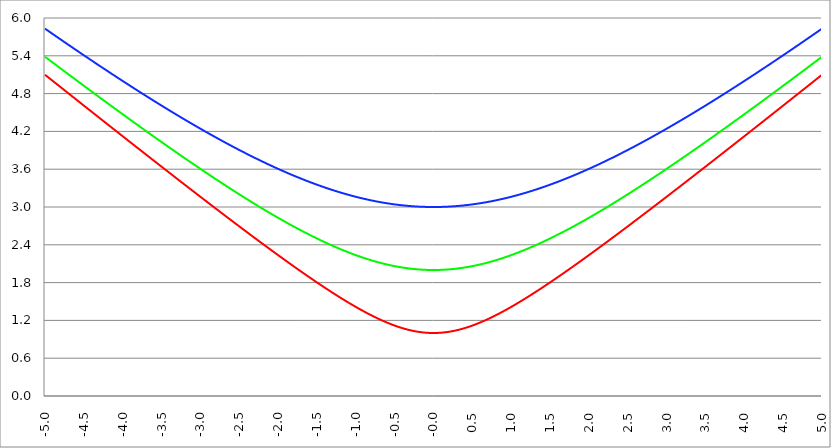
| Category | Series 1 | Series 0 | Series 2 |
|---|---|---|---|
| -5.0 | 5.099 | 5.385 | 5.831 |
| -4.995 | 5.094 | 5.381 | 5.827 |
| -4.99 | 5.089 | 5.376 | 5.822 |
| -4.985 | 5.084 | 5.371 | 5.818 |
| -4.98 | 5.079 | 5.367 | 5.814 |
| -4.975 | 5.075 | 5.362 | 5.81 |
| -4.97 | 5.07 | 5.357 | 5.805 |
| -4.965000000000001 | 5.065 | 5.353 | 5.801 |
| -4.960000000000001 | 5.06 | 5.348 | 5.797 |
| -4.955000000000001 | 5.055 | 5.343 | 5.792 |
| -4.950000000000001 | 5.05 | 5.339 | 5.788 |
| -4.945000000000001 | 5.045 | 5.334 | 5.784 |
| -4.940000000000001 | 5.04 | 5.33 | 5.78 |
| -4.935000000000001 | 5.035 | 5.325 | 5.775 |
| -4.930000000000001 | 5.03 | 5.32 | 5.771 |
| -4.925000000000002 | 5.025 | 5.316 | 5.767 |
| -4.920000000000002 | 5.021 | 5.311 | 5.762 |
| -4.915000000000002 | 5.016 | 5.306 | 5.758 |
| -4.910000000000002 | 5.011 | 5.302 | 5.754 |
| -4.905000000000002 | 5.006 | 5.297 | 5.75 |
| -4.900000000000002 | 5.001 | 5.292 | 5.745 |
| -4.895000000000002 | 4.996 | 5.288 | 5.741 |
| -4.890000000000002 | 4.991 | 5.283 | 5.737 |
| -4.885000000000002 | 4.986 | 5.279 | 5.733 |
| -4.880000000000002 | 4.981 | 5.274 | 5.728 |
| -4.875000000000003 | 4.977 | 5.269 | 5.724 |
| -4.870000000000003 | 4.972 | 5.265 | 5.72 |
| -4.865000000000003 | 4.967 | 5.26 | 5.716 |
| -4.860000000000003 | 4.962 | 5.255 | 5.711 |
| -4.855000000000003 | 4.957 | 5.251 | 5.707 |
| -4.850000000000003 | 4.952 | 5.246 | 5.703 |
| -4.845000000000003 | 4.947 | 5.242 | 5.699 |
| -4.840000000000003 | 4.942 | 5.237 | 5.694 |
| -4.835000000000003 | 4.937 | 5.232 | 5.69 |
| -4.830000000000004 | 4.932 | 5.228 | 5.686 |
| -4.825000000000004 | 4.928 | 5.223 | 5.682 |
| -4.820000000000004 | 4.923 | 5.218 | 5.677 |
| -4.815000000000004 | 4.918 | 5.214 | 5.673 |
| -4.810000000000004 | 4.913 | 5.209 | 5.669 |
| -4.805000000000004 | 4.908 | 5.205 | 5.665 |
| -4.800000000000004 | 4.903 | 5.2 | 5.66 |
| -4.795000000000004 | 4.898 | 5.195 | 5.656 |
| -4.790000000000004 | 4.893 | 5.191 | 5.652 |
| -4.785000000000004 | 4.888 | 5.186 | 5.648 |
| -4.780000000000004 | 4.883 | 5.182 | 5.643 |
| -4.775000000000004 | 4.879 | 5.177 | 5.639 |
| -4.770000000000004 | 4.874 | 5.172 | 5.635 |
| -4.765000000000005 | 4.869 | 5.168 | 5.631 |
| -4.760000000000005 | 4.864 | 5.163 | 5.627 |
| -4.755000000000005 | 4.859 | 5.158 | 5.622 |
| -4.750000000000005 | 4.854 | 5.154 | 5.618 |
| -4.745000000000005 | 4.849 | 5.149 | 5.614 |
| -4.740000000000005 | 4.844 | 5.145 | 5.61 |
| -4.735000000000005 | 4.839 | 5.14 | 5.605 |
| -4.730000000000005 | 4.835 | 5.135 | 5.601 |
| -4.725000000000006 | 4.83 | 5.131 | 5.597 |
| -4.720000000000006 | 4.825 | 5.126 | 5.593 |
| -4.715000000000006 | 4.82 | 5.122 | 5.588 |
| -4.710000000000006 | 4.815 | 5.117 | 5.584 |
| -4.705000000000006 | 4.81 | 5.112 | 5.58 |
| -4.700000000000006 | 4.805 | 5.108 | 5.576 |
| -4.695000000000006 | 4.8 | 5.103 | 5.572 |
| -4.690000000000006 | 4.795 | 5.099 | 5.567 |
| -4.685000000000007 | 4.791 | 5.094 | 5.563 |
| -4.680000000000007 | 4.786 | 5.089 | 5.559 |
| -4.675000000000007 | 4.781 | 5.085 | 5.555 |
| -4.670000000000007 | 4.776 | 5.08 | 5.551 |
| -4.665000000000007 | 4.771 | 5.076 | 5.546 |
| -4.660000000000007 | 4.766 | 5.071 | 5.542 |
| -4.655000000000007 | 4.761 | 5.066 | 5.538 |
| -4.650000000000007 | 4.756 | 5.062 | 5.534 |
| -4.645000000000007 | 4.751 | 5.057 | 5.53 |
| -4.640000000000008 | 4.747 | 5.053 | 5.525 |
| -4.635000000000008 | 4.742 | 5.048 | 5.521 |
| -4.630000000000008 | 4.737 | 5.044 | 5.517 |
| -4.625000000000008 | 4.732 | 5.039 | 5.513 |
| -4.620000000000008 | 4.727 | 5.034 | 5.509 |
| -4.615000000000008 | 4.722 | 5.03 | 5.504 |
| -4.610000000000008 | 4.717 | 5.025 | 5.5 |
| -4.605000000000008 | 4.712 | 5.021 | 5.496 |
| -4.600000000000008 | 4.707 | 5.016 | 5.492 |
| -4.595000000000009 | 4.703 | 5.011 | 5.488 |
| -4.590000000000009 | 4.698 | 5.007 | 5.483 |
| -4.585000000000009 | 4.693 | 5.002 | 5.479 |
| -4.580000000000009 | 4.688 | 4.998 | 5.475 |
| -4.57500000000001 | 4.683 | 4.993 | 5.471 |
| -4.57000000000001 | 4.678 | 4.988 | 5.467 |
| -4.565000000000009 | 4.673 | 4.984 | 5.463 |
| -4.560000000000009 | 4.668 | 4.979 | 5.458 |
| -4.555000000000009 | 4.663 | 4.975 | 5.454 |
| -4.55000000000001 | 4.659 | 4.97 | 5.45 |
| -4.54500000000001 | 4.654 | 4.966 | 5.446 |
| -4.54000000000001 | 4.649 | 4.961 | 5.442 |
| -4.53500000000001 | 4.644 | 4.956 | 5.437 |
| -4.53000000000001 | 4.639 | 4.952 | 5.433 |
| -4.52500000000001 | 4.634 | 4.947 | 5.429 |
| -4.52000000000001 | 4.629 | 4.943 | 5.425 |
| -4.51500000000001 | 4.624 | 4.938 | 5.421 |
| -4.51000000000001 | 4.62 | 4.934 | 5.417 |
| -4.505000000000011 | 4.615 | 4.929 | 5.412 |
| -4.500000000000011 | 4.61 | 4.924 | 5.408 |
| -4.495000000000011 | 4.605 | 4.92 | 5.404 |
| -4.490000000000011 | 4.6 | 4.915 | 5.4 |
| -4.485000000000011 | 4.595 | 4.911 | 5.396 |
| -4.480000000000011 | 4.59 | 4.906 | 5.392 |
| -4.475000000000011 | 4.585 | 4.902 | 5.388 |
| -4.470000000000011 | 4.58 | 4.897 | 5.383 |
| -4.465000000000011 | 4.576 | 4.892 | 5.379 |
| -4.460000000000011 | 4.571 | 4.888 | 5.375 |
| -4.455000000000012 | 4.566 | 4.883 | 5.371 |
| -4.450000000000012 | 4.561 | 4.879 | 5.367 |
| -4.445000000000012 | 4.556 | 4.874 | 5.363 |
| -4.440000000000012 | 4.551 | 4.87 | 5.359 |
| -4.435000000000012 | 4.546 | 4.865 | 5.354 |
| -4.430000000000012 | 4.541 | 4.861 | 5.35 |
| -4.425000000000012 | 4.537 | 4.856 | 5.346 |
| -4.420000000000012 | 4.532 | 4.851 | 5.342 |
| -4.415000000000012 | 4.527 | 4.847 | 5.338 |
| -4.410000000000013 | 4.522 | 4.842 | 5.334 |
| -4.405000000000013 | 4.517 | 4.838 | 5.33 |
| -4.400000000000013 | 4.512 | 4.833 | 5.325 |
| -4.395000000000013 | 4.507 | 4.829 | 5.321 |
| -4.390000000000013 | 4.502 | 4.824 | 5.317 |
| -4.385000000000013 | 4.498 | 4.82 | 5.313 |
| -4.380000000000013 | 4.493 | 4.815 | 5.309 |
| -4.375000000000013 | 4.488 | 4.81 | 5.305 |
| -4.370000000000013 | 4.483 | 4.806 | 5.301 |
| -4.365000000000013 | 4.478 | 4.801 | 5.297 |
| -4.360000000000014 | 4.473 | 4.797 | 5.292 |
| -4.355000000000014 | 4.468 | 4.792 | 5.288 |
| -4.350000000000014 | 4.463 | 4.788 | 5.284 |
| -4.345000000000014 | 4.459 | 4.783 | 5.28 |
| -4.340000000000014 | 4.454 | 4.779 | 5.276 |
| -4.335000000000014 | 4.449 | 4.774 | 5.272 |
| -4.330000000000014 | 4.444 | 4.77 | 5.268 |
| -4.325000000000014 | 4.439 | 4.765 | 5.264 |
| -4.320000000000014 | 4.434 | 4.761 | 5.26 |
| -4.315000000000015 | 4.429 | 4.756 | 5.255 |
| -4.310000000000015 | 4.424 | 4.751 | 5.251 |
| -4.305000000000015 | 4.42 | 4.747 | 5.247 |
| -4.300000000000015 | 4.415 | 4.742 | 5.243 |
| -4.295000000000015 | 4.41 | 4.738 | 5.239 |
| -4.290000000000015 | 4.405 | 4.733 | 5.235 |
| -4.285000000000015 | 4.4 | 4.729 | 5.231 |
| -4.280000000000015 | 4.395 | 4.724 | 5.227 |
| -4.275000000000015 | 4.39 | 4.72 | 5.223 |
| -4.270000000000015 | 4.386 | 4.715 | 5.219 |
| -4.265000000000016 | 4.381 | 4.711 | 5.214 |
| -4.260000000000016 | 4.376 | 4.706 | 5.21 |
| -4.255000000000016 | 4.371 | 4.702 | 5.206 |
| -4.250000000000016 | 4.366 | 4.697 | 5.202 |
| -4.245000000000016 | 4.361 | 4.693 | 5.198 |
| -4.240000000000016 | 4.356 | 4.688 | 5.194 |
| -4.235000000000016 | 4.351 | 4.684 | 5.19 |
| -4.230000000000016 | 4.347 | 4.679 | 5.186 |
| -4.225000000000017 | 4.342 | 4.674 | 5.182 |
| -4.220000000000017 | 4.337 | 4.67 | 5.178 |
| -4.215000000000017 | 4.332 | 4.665 | 5.174 |
| -4.210000000000017 | 4.327 | 4.661 | 5.17 |
| -4.205000000000017 | 4.322 | 4.656 | 5.165 |
| -4.200000000000017 | 4.317 | 4.652 | 5.161 |
| -4.195000000000017 | 4.313 | 4.647 | 5.157 |
| -4.190000000000017 | 4.308 | 4.643 | 5.153 |
| -4.185000000000017 | 4.303 | 4.638 | 5.149 |
| -4.180000000000017 | 4.298 | 4.634 | 5.145 |
| -4.175000000000018 | 4.293 | 4.629 | 5.141 |
| -4.170000000000018 | 4.288 | 4.625 | 5.137 |
| -4.165000000000018 | 4.283 | 4.62 | 5.133 |
| -4.160000000000018 | 4.279 | 4.616 | 5.129 |
| -4.155000000000018 | 4.274 | 4.611 | 5.125 |
| -4.150000000000018 | 4.269 | 4.607 | 5.121 |
| -4.145000000000018 | 4.264 | 4.602 | 5.117 |
| -4.140000000000018 | 4.259 | 4.598 | 5.113 |
| -4.135000000000018 | 4.254 | 4.593 | 5.109 |
| -4.130000000000019 | 4.249 | 4.589 | 5.105 |
| -4.125000000000019 | 4.244 | 4.584 | 5.101 |
| -4.120000000000019 | 4.24 | 4.58 | 5.097 |
| -4.115000000000019 | 4.235 | 4.575 | 5.092 |
| -4.110000000000019 | 4.23 | 4.571 | 5.088 |
| -4.105000000000019 | 4.225 | 4.566 | 5.084 |
| -4.100000000000019 | 4.22 | 4.562 | 5.08 |
| -4.095000000000019 | 4.215 | 4.557 | 5.076 |
| -4.090000000000019 | 4.21 | 4.553 | 5.072 |
| -4.085000000000019 | 4.206 | 4.548 | 5.068 |
| -4.08000000000002 | 4.201 | 4.544 | 5.064 |
| -4.07500000000002 | 4.196 | 4.539 | 5.06 |
| -4.07000000000002 | 4.191 | 4.535 | 5.056 |
| -4.06500000000002 | 4.186 | 4.53 | 5.052 |
| -4.06000000000002 | 4.181 | 4.526 | 5.048 |
| -4.05500000000002 | 4.176 | 4.521 | 5.044 |
| -4.05000000000002 | 4.172 | 4.517 | 5.04 |
| -4.04500000000002 | 4.167 | 4.512 | 5.036 |
| -4.04000000000002 | 4.162 | 4.508 | 5.032 |
| -4.03500000000002 | 4.157 | 4.503 | 5.028 |
| -4.03000000000002 | 4.152 | 4.499 | 5.024 |
| -4.025000000000021 | 4.147 | 4.495 | 5.02 |
| -4.020000000000021 | 4.143 | 4.49 | 5.016 |
| -4.015000000000021 | 4.138 | 4.486 | 5.012 |
| -4.010000000000021 | 4.133 | 4.481 | 5.008 |
| -4.005000000000021 | 4.128 | 4.477 | 5.004 |
| -4.000000000000021 | 4.123 | 4.472 | 5 |
| -3.995000000000021 | 4.118 | 4.468 | 4.996 |
| -3.990000000000021 | 4.113 | 4.463 | 4.992 |
| -3.985000000000022 | 4.109 | 4.459 | 4.988 |
| -3.980000000000022 | 4.104 | 4.454 | 4.984 |
| -3.975000000000022 | 4.099 | 4.45 | 4.98 |
| -3.970000000000022 | 4.094 | 4.445 | 4.976 |
| -3.965000000000022 | 4.089 | 4.441 | 4.972 |
| -3.960000000000022 | 4.084 | 4.436 | 4.968 |
| -3.955000000000022 | 4.079 | 4.432 | 4.964 |
| -3.950000000000022 | 4.075 | 4.427 | 4.96 |
| -3.945000000000022 | 4.07 | 4.423 | 4.956 |
| -3.940000000000023 | 4.065 | 4.419 | 4.952 |
| -3.935000000000023 | 4.06 | 4.414 | 4.948 |
| -3.930000000000023 | 4.055 | 4.41 | 4.944 |
| -3.925000000000023 | 4.05 | 4.405 | 4.94 |
| -3.920000000000023 | 4.046 | 4.401 | 4.936 |
| -3.915000000000023 | 4.041 | 4.396 | 4.932 |
| -3.910000000000023 | 4.036 | 4.392 | 4.928 |
| -3.905000000000023 | 4.031 | 4.387 | 4.924 |
| -3.900000000000023 | 4.026 | 4.383 | 4.92 |
| -3.895000000000023 | 4.021 | 4.378 | 4.916 |
| -3.890000000000024 | 4.016 | 4.374 | 4.912 |
| -3.885000000000024 | 4.012 | 4.37 | 4.908 |
| -3.880000000000024 | 4.007 | 4.365 | 4.905 |
| -3.875000000000024 | 4.002 | 4.361 | 4.901 |
| -3.870000000000024 | 3.997 | 4.356 | 4.897 |
| -3.865000000000024 | 3.992 | 4.352 | 4.893 |
| -3.860000000000024 | 3.987 | 4.347 | 4.889 |
| -3.855000000000024 | 3.983 | 4.343 | 4.885 |
| -3.850000000000024 | 3.978 | 4.338 | 4.881 |
| -3.845000000000025 | 3.973 | 4.334 | 4.877 |
| -3.840000000000025 | 3.968 | 4.33 | 4.873 |
| -3.835000000000025 | 3.963 | 4.325 | 4.869 |
| -3.830000000000025 | 3.958 | 4.321 | 4.865 |
| -3.825000000000025 | 3.954 | 4.316 | 4.861 |
| -3.820000000000025 | 3.949 | 4.312 | 4.857 |
| -3.815000000000025 | 3.944 | 4.307 | 4.853 |
| -3.810000000000025 | 3.939 | 4.303 | 4.849 |
| -3.805000000000025 | 3.934 | 4.299 | 4.845 |
| -3.800000000000026 | 3.929 | 4.294 | 4.841 |
| -3.795000000000026 | 3.925 | 4.29 | 4.838 |
| -3.790000000000026 | 3.92 | 4.285 | 4.834 |
| -3.785000000000026 | 3.915 | 4.281 | 4.83 |
| -3.780000000000026 | 3.91 | 4.276 | 4.826 |
| -3.775000000000026 | 3.905 | 4.272 | 4.822 |
| -3.770000000000026 | 3.9 | 4.268 | 4.818 |
| -3.765000000000026 | 3.896 | 4.263 | 4.814 |
| -3.760000000000026 | 3.891 | 4.259 | 4.81 |
| -3.755000000000026 | 3.886 | 4.254 | 4.806 |
| -3.750000000000027 | 3.881 | 4.25 | 4.802 |
| -3.745000000000027 | 3.876 | 4.246 | 4.798 |
| -3.740000000000027 | 3.871 | 4.241 | 4.795 |
| -3.735000000000027 | 3.867 | 4.237 | 4.791 |
| -3.730000000000027 | 3.862 | 4.232 | 4.787 |
| -3.725000000000027 | 3.857 | 4.228 | 4.783 |
| -3.720000000000027 | 3.852 | 4.224 | 4.779 |
| -3.715000000000027 | 3.847 | 4.219 | 4.775 |
| -3.710000000000027 | 3.842 | 4.215 | 4.771 |
| -3.705000000000028 | 3.838 | 4.21 | 4.767 |
| -3.700000000000028 | 3.833 | 4.206 | 4.763 |
| -3.695000000000028 | 3.828 | 4.202 | 4.76 |
| -3.690000000000028 | 3.823 | 4.197 | 4.756 |
| -3.685000000000028 | 3.818 | 4.193 | 4.752 |
| -3.680000000000028 | 3.813 | 4.188 | 4.748 |
| -3.675000000000028 | 3.809 | 4.184 | 4.744 |
| -3.670000000000028 | 3.804 | 4.18 | 4.74 |
| -3.665000000000028 | 3.799 | 4.175 | 4.736 |
| -3.660000000000028 | 3.794 | 4.171 | 4.732 |
| -3.655000000000029 | 3.789 | 4.166 | 4.729 |
| -3.650000000000029 | 3.785 | 4.162 | 4.725 |
| -3.645000000000029 | 3.78 | 4.158 | 4.721 |
| -3.640000000000029 | 3.775 | 4.153 | 4.717 |
| -3.635000000000029 | 3.77 | 4.149 | 4.713 |
| -3.630000000000029 | 3.765 | 4.145 | 4.709 |
| -3.625000000000029 | 3.76 | 4.14 | 4.705 |
| -3.620000000000029 | 3.756 | 4.136 | 4.702 |
| -3.615000000000029 | 3.751 | 4.131 | 4.698 |
| -3.61000000000003 | 3.746 | 4.127 | 4.694 |
| -3.60500000000003 | 3.741 | 4.123 | 4.69 |
| -3.60000000000003 | 3.736 | 4.118 | 4.686 |
| -3.59500000000003 | 3.731 | 4.114 | 4.682 |
| -3.59000000000003 | 3.727 | 4.11 | 4.678 |
| -3.58500000000003 | 3.722 | 4.105 | 4.675 |
| -3.58000000000003 | 3.717 | 4.101 | 4.671 |
| -3.57500000000003 | 3.712 | 4.096 | 4.667 |
| -3.57000000000003 | 3.707 | 4.092 | 4.663 |
| -3.565000000000031 | 3.703 | 4.088 | 4.659 |
| -3.560000000000031 | 3.698 | 4.083 | 4.655 |
| -3.555000000000031 | 3.693 | 4.079 | 4.652 |
| -3.550000000000031 | 3.688 | 4.075 | 4.648 |
| -3.545000000000031 | 3.683 | 4.07 | 4.644 |
| -3.540000000000031 | 3.679 | 4.066 | 4.64 |
| -3.535000000000031 | 3.674 | 4.062 | 4.636 |
| -3.530000000000031 | 3.669 | 4.057 | 4.633 |
| -3.525000000000031 | 3.664 | 4.053 | 4.629 |
| -3.520000000000032 | 3.659 | 4.049 | 4.625 |
| -3.515000000000032 | 3.654 | 4.044 | 4.621 |
| -3.510000000000032 | 3.65 | 4.04 | 4.617 |
| -3.505000000000032 | 3.645 | 4.035 | 4.614 |
| -3.500000000000032 | 3.64 | 4.031 | 4.61 |
| -3.495000000000032 | 3.635 | 4.027 | 4.606 |
| -3.490000000000032 | 3.63 | 4.022 | 4.602 |
| -3.485000000000032 | 3.626 | 4.018 | 4.598 |
| -3.480000000000032 | 3.621 | 4.014 | 4.595 |
| -3.475000000000032 | 3.616 | 4.009 | 4.591 |
| -3.470000000000033 | 3.611 | 4.005 | 4.587 |
| -3.465000000000033 | 3.606 | 4.001 | 4.583 |
| -3.460000000000033 | 3.602 | 3.996 | 4.579 |
| -3.455000000000033 | 3.597 | 3.992 | 4.576 |
| -3.450000000000033 | 3.592 | 3.988 | 4.572 |
| -3.445000000000033 | 3.587 | 3.983 | 4.568 |
| -3.440000000000033 | 3.582 | 3.979 | 4.564 |
| -3.435000000000033 | 3.578 | 3.975 | 4.561 |
| -3.430000000000033 | 3.573 | 3.971 | 4.557 |
| -3.425000000000034 | 3.568 | 3.966 | 4.553 |
| -3.420000000000034 | 3.563 | 3.962 | 4.549 |
| -3.415000000000034 | 3.558 | 3.958 | 4.546 |
| -3.410000000000034 | 3.554 | 3.953 | 4.542 |
| -3.405000000000034 | 3.549 | 3.949 | 4.538 |
| -3.400000000000034 | 3.544 | 3.945 | 4.534 |
| -3.395000000000034 | 3.539 | 3.94 | 4.531 |
| -3.390000000000034 | 3.534 | 3.936 | 4.527 |
| -3.385000000000034 | 3.53 | 3.932 | 4.523 |
| -3.380000000000034 | 3.525 | 3.927 | 4.519 |
| -3.375000000000035 | 3.52 | 3.923 | 4.516 |
| -3.370000000000035 | 3.515 | 3.919 | 4.512 |
| -3.365000000000035 | 3.51 | 3.914 | 4.508 |
| -3.360000000000035 | 3.506 | 3.91 | 4.504 |
| -3.355000000000035 | 3.501 | 3.906 | 4.501 |
| -3.350000000000035 | 3.496 | 3.902 | 4.497 |
| -3.345000000000035 | 3.491 | 3.897 | 4.493 |
| -3.340000000000035 | 3.486 | 3.893 | 4.489 |
| -3.335000000000035 | 3.482 | 3.889 | 4.486 |
| -3.330000000000036 | 3.477 | 3.884 | 4.482 |
| -3.325000000000036 | 3.472 | 3.88 | 4.478 |
| -3.320000000000036 | 3.467 | 3.876 | 4.475 |
| -3.315000000000036 | 3.463 | 3.872 | 4.471 |
| -3.310000000000036 | 3.458 | 3.867 | 4.467 |
| -3.305000000000036 | 3.453 | 3.863 | 4.464 |
| -3.300000000000036 | 3.448 | 3.859 | 4.46 |
| -3.295000000000036 | 3.443 | 3.854 | 4.456 |
| -3.290000000000036 | 3.439 | 3.85 | 4.452 |
| -3.285000000000036 | 3.434 | 3.846 | 4.449 |
| -3.280000000000036 | 3.429 | 3.842 | 4.445 |
| -3.275000000000037 | 3.424 | 3.837 | 4.441 |
| -3.270000000000037 | 3.419 | 3.833 | 4.438 |
| -3.265000000000037 | 3.415 | 3.829 | 4.434 |
| -3.260000000000037 | 3.41 | 3.825 | 4.43 |
| -3.255000000000037 | 3.405 | 3.82 | 4.427 |
| -3.250000000000037 | 3.4 | 3.816 | 4.423 |
| -3.245000000000037 | 3.396 | 3.812 | 4.419 |
| -3.240000000000037 | 3.391 | 3.808 | 4.416 |
| -3.235000000000038 | 3.386 | 3.803 | 4.412 |
| -3.230000000000038 | 3.381 | 3.799 | 4.408 |
| -3.225000000000038 | 3.376 | 3.795 | 4.405 |
| -3.220000000000038 | 3.372 | 3.791 | 4.401 |
| -3.215000000000038 | 3.367 | 3.786 | 4.397 |
| -3.210000000000038 | 3.362 | 3.782 | 4.394 |
| -3.205000000000038 | 3.357 | 3.778 | 4.39 |
| -3.200000000000038 | 3.353 | 3.774 | 4.386 |
| -3.195000000000038 | 3.348 | 3.769 | 4.383 |
| -3.190000000000039 | 3.343 | 3.765 | 4.379 |
| -3.185000000000039 | 3.338 | 3.761 | 4.375 |
| -3.180000000000039 | 3.334 | 3.757 | 4.372 |
| -3.175000000000039 | 3.329 | 3.752 | 4.368 |
| -3.170000000000039 | 3.324 | 3.748 | 4.365 |
| -3.16500000000004 | 3.319 | 3.744 | 4.361 |
| -3.16000000000004 | 3.314 | 3.74 | 4.357 |
| -3.155000000000039 | 3.31 | 3.736 | 4.354 |
| -3.150000000000039 | 3.305 | 3.731 | 4.35 |
| -3.14500000000004 | 3.3 | 3.727 | 4.346 |
| -3.14000000000004 | 3.295 | 3.723 | 4.343 |
| -3.13500000000004 | 3.291 | 3.719 | 4.339 |
| -3.13000000000004 | 3.286 | 3.714 | 4.336 |
| -3.12500000000004 | 3.281 | 3.71 | 4.332 |
| -3.12000000000004 | 3.276 | 3.706 | 4.328 |
| -3.11500000000004 | 3.272 | 3.702 | 4.325 |
| -3.11000000000004 | 3.267 | 3.698 | 4.321 |
| -3.10500000000004 | 3.262 | 3.693 | 4.318 |
| -3.10000000000004 | 3.257 | 3.689 | 4.314 |
| -3.095000000000041 | 3.253 | 3.685 | 4.31 |
| -3.090000000000041 | 3.248 | 3.681 | 4.307 |
| -3.085000000000041 | 3.243 | 3.677 | 4.303 |
| -3.080000000000041 | 3.238 | 3.672 | 4.3 |
| -3.075000000000041 | 3.234 | 3.668 | 4.296 |
| -3.070000000000041 | 3.229 | 3.664 | 4.292 |
| -3.065000000000041 | 3.224 | 3.66 | 4.289 |
| -3.060000000000041 | 3.219 | 3.656 | 4.285 |
| -3.055000000000041 | 3.215 | 3.651 | 4.282 |
| -3.050000000000042 | 3.21 | 3.647 | 4.278 |
| -3.045000000000042 | 3.205 | 3.643 | 4.275 |
| -3.040000000000042 | 3.2 | 3.639 | 4.271 |
| -3.035000000000042 | 3.196 | 3.635 | 4.267 |
| -3.030000000000042 | 3.191 | 3.631 | 4.264 |
| -3.025000000000042 | 3.186 | 3.626 | 4.26 |
| -3.020000000000042 | 3.181 | 3.622 | 4.257 |
| -3.015000000000042 | 3.177 | 3.618 | 4.253 |
| -3.010000000000042 | 3.172 | 3.614 | 4.25 |
| -3.005000000000043 | 3.167 | 3.61 | 4.246 |
| -3.000000000000043 | 3.162 | 3.606 | 4.243 |
| -2.995000000000043 | 3.158 | 3.601 | 4.239 |
| -2.990000000000043 | 3.153 | 3.597 | 4.236 |
| -2.985000000000043 | 3.148 | 3.593 | 4.232 |
| -2.980000000000043 | 3.143 | 3.589 | 4.229 |
| -2.975000000000043 | 3.139 | 3.585 | 4.225 |
| -2.970000000000043 | 3.134 | 3.581 | 4.221 |
| -2.965000000000043 | 3.129 | 3.576 | 4.218 |
| -2.960000000000043 | 3.124 | 3.572 | 4.214 |
| -2.955000000000044 | 3.12 | 3.568 | 4.211 |
| -2.950000000000044 | 3.115 | 3.564 | 4.207 |
| -2.945000000000044 | 3.11 | 3.56 | 4.204 |
| -2.940000000000044 | 3.105 | 3.556 | 4.2 |
| -2.935000000000044 | 3.101 | 3.552 | 4.197 |
| -2.930000000000044 | 3.096 | 3.548 | 4.193 |
| -2.925000000000044 | 3.091 | 3.543 | 4.19 |
| -2.920000000000044 | 3.086 | 3.539 | 4.186 |
| -2.915000000000044 | 3.082 | 3.535 | 4.183 |
| -2.910000000000045 | 3.077 | 3.531 | 4.179 |
| -2.905000000000045 | 3.072 | 3.527 | 4.176 |
| -2.900000000000045 | 3.068 | 3.523 | 4.173 |
| -2.895000000000045 | 3.063 | 3.519 | 4.169 |
| -2.890000000000045 | 3.058 | 3.515 | 4.166 |
| -2.885000000000045 | 3.053 | 3.51 | 4.162 |
| -2.880000000000045 | 3.049 | 3.506 | 4.159 |
| -2.875000000000045 | 3.044 | 3.502 | 4.155 |
| -2.870000000000045 | 3.039 | 3.498 | 4.152 |
| -2.865000000000045 | 3.035 | 3.494 | 4.148 |
| -2.860000000000046 | 3.03 | 3.49 | 4.145 |
| -2.855000000000046 | 3.025 | 3.486 | 4.141 |
| -2.850000000000046 | 3.02 | 3.482 | 4.138 |
| -2.845000000000046 | 3.016 | 3.478 | 4.134 |
| -2.840000000000046 | 3.011 | 3.474 | 4.131 |
| -2.835000000000046 | 3.006 | 3.469 | 4.128 |
| -2.830000000000046 | 3.001 | 3.465 | 4.124 |
| -2.825000000000046 | 2.997 | 3.461 | 4.121 |
| -2.820000000000046 | 2.992 | 3.457 | 4.117 |
| -2.815000000000047 | 2.987 | 3.453 | 4.114 |
| -2.810000000000047 | 2.983 | 3.449 | 4.11 |
| -2.805000000000047 | 2.978 | 3.445 | 4.107 |
| -2.800000000000047 | 2.973 | 3.441 | 4.104 |
| -2.795000000000047 | 2.969 | 3.437 | 4.1 |
| -2.790000000000047 | 2.964 | 3.433 | 4.097 |
| -2.785000000000047 | 2.959 | 3.429 | 4.093 |
| -2.780000000000047 | 2.954 | 3.425 | 4.09 |
| -2.775000000000047 | 2.95 | 3.421 | 4.087 |
| -2.770000000000047 | 2.945 | 3.417 | 4.083 |
| -2.765000000000048 | 2.94 | 3.413 | 4.08 |
| -2.760000000000048 | 2.936 | 3.408 | 4.076 |
| -2.755000000000048 | 2.931 | 3.404 | 4.073 |
| -2.750000000000048 | 2.926 | 3.4 | 4.07 |
| -2.745000000000048 | 2.921 | 3.396 | 4.066 |
| -2.740000000000048 | 2.917 | 3.392 | 4.063 |
| -2.735000000000048 | 2.912 | 3.388 | 4.06 |
| -2.730000000000048 | 2.907 | 3.384 | 4.056 |
| -2.725000000000048 | 2.903 | 3.38 | 4.053 |
| -2.720000000000049 | 2.898 | 3.376 | 4.049 |
| -2.715000000000049 | 2.893 | 3.372 | 4.046 |
| -2.710000000000049 | 2.889 | 3.368 | 4.043 |
| -2.705000000000049 | 2.884 | 3.364 | 4.039 |
| -2.700000000000049 | 2.879 | 3.36 | 4.036 |
| -2.695000000000049 | 2.875 | 3.356 | 4.033 |
| -2.690000000000049 | 2.87 | 3.352 | 4.029 |
| -2.685000000000049 | 2.865 | 3.348 | 4.026 |
| -2.680000000000049 | 2.86 | 3.344 | 4.023 |
| -2.675000000000049 | 2.856 | 3.34 | 4.019 |
| -2.67000000000005 | 2.851 | 3.336 | 4.016 |
| -2.66500000000005 | 2.846 | 3.332 | 4.013 |
| -2.66000000000005 | 2.842 | 3.328 | 4.009 |
| -2.65500000000005 | 2.837 | 3.324 | 4.006 |
| -2.65000000000005 | 2.832 | 3.32 | 4.003 |
| -2.64500000000005 | 2.828 | 3.316 | 4 |
| -2.64000000000005 | 2.823 | 3.312 | 3.996 |
| -2.63500000000005 | 2.818 | 3.308 | 3.993 |
| -2.63000000000005 | 2.814 | 3.304 | 3.99 |
| -2.625000000000051 | 2.809 | 3.3 | 3.986 |
| -2.620000000000051 | 2.804 | 3.296 | 3.983 |
| -2.615000000000051 | 2.8 | 3.292 | 3.98 |
| -2.610000000000051 | 2.795 | 3.288 | 3.976 |
| -2.605000000000051 | 2.79 | 3.284 | 3.973 |
| -2.600000000000051 | 2.786 | 3.28 | 3.97 |
| -2.595000000000051 | 2.781 | 3.276 | 3.967 |
| -2.590000000000051 | 2.776 | 3.272 | 3.963 |
| -2.585000000000051 | 2.772 | 3.268 | 3.96 |
| -2.580000000000052 | 2.767 | 3.264 | 3.957 |
| -2.575000000000052 | 2.762 | 3.26 | 3.954 |
| -2.570000000000052 | 2.758 | 3.257 | 3.95 |
| -2.565000000000052 | 2.753 | 3.253 | 3.947 |
| -2.560000000000052 | 2.748 | 3.249 | 3.944 |
| -2.555000000000052 | 2.744 | 3.245 | 3.941 |
| -2.550000000000052 | 2.739 | 3.241 | 3.937 |
| -2.545000000000052 | 2.734 | 3.237 | 3.934 |
| -2.540000000000052 | 2.73 | 3.233 | 3.931 |
| -2.535000000000053 | 2.725 | 3.229 | 3.928 |
| -2.530000000000053 | 2.72 | 3.225 | 3.924 |
| -2.525000000000053 | 2.716 | 3.221 | 3.921 |
| -2.520000000000053 | 2.711 | 3.217 | 3.918 |
| -2.515000000000053 | 2.707 | 3.213 | 3.915 |
| -2.510000000000053 | 2.702 | 3.209 | 3.912 |
| -2.505000000000053 | 2.697 | 3.205 | 3.908 |
| -2.500000000000053 | 2.693 | 3.202 | 3.905 |
| -2.495000000000053 | 2.688 | 3.198 | 3.902 |
| -2.490000000000053 | 2.683 | 3.194 | 3.899 |
| -2.485000000000054 | 2.679 | 3.19 | 3.896 |
| -2.480000000000054 | 2.674 | 3.186 | 3.892 |
| -2.475000000000054 | 2.669 | 3.182 | 3.889 |
| -2.470000000000054 | 2.665 | 3.178 | 3.886 |
| -2.465000000000054 | 2.66 | 3.174 | 3.883 |
| -2.460000000000054 | 2.655 | 3.17 | 3.88 |
| -2.455000000000054 | 2.651 | 3.167 | 3.876 |
| -2.450000000000054 | 2.646 | 3.163 | 3.873 |
| -2.445000000000054 | 2.642 | 3.159 | 3.87 |
| -2.440000000000055 | 2.637 | 3.155 | 3.867 |
| -2.435000000000055 | 2.632 | 3.151 | 3.864 |
| -2.430000000000055 | 2.628 | 3.147 | 3.861 |
| -2.425000000000055 | 2.623 | 3.143 | 3.858 |
| -2.420000000000055 | 2.618 | 3.139 | 3.854 |
| -2.415000000000055 | 2.614 | 3.136 | 3.851 |
| -2.410000000000055 | 2.609 | 3.132 | 3.848 |
| -2.405000000000055 | 2.605 | 3.128 | 3.845 |
| -2.400000000000055 | 2.6 | 3.124 | 3.842 |
| -2.395000000000055 | 2.595 | 3.12 | 3.839 |
| -2.390000000000056 | 2.591 | 3.116 | 3.836 |
| -2.385000000000056 | 2.586 | 3.113 | 3.833 |
| -2.380000000000056 | 2.582 | 3.109 | 3.829 |
| -2.375000000000056 | 2.577 | 3.105 | 3.826 |
| -2.370000000000056 | 2.572 | 3.101 | 3.823 |
| -2.365000000000056 | 2.568 | 3.097 | 3.82 |
| -2.360000000000056 | 2.563 | 3.093 | 3.817 |
| -2.355000000000056 | 2.559 | 3.09 | 3.814 |
| -2.350000000000056 | 2.554 | 3.086 | 3.811 |
| -2.345000000000057 | 2.549 | 3.082 | 3.808 |
| -2.340000000000057 | 2.545 | 3.078 | 3.805 |
| -2.335000000000057 | 2.54 | 3.074 | 3.802 |
| -2.330000000000057 | 2.536 | 3.071 | 3.799 |
| -2.325000000000057 | 2.531 | 3.067 | 3.795 |
| -2.320000000000057 | 2.526 | 3.063 | 3.792 |
| -2.315000000000057 | 2.522 | 3.059 | 3.789 |
| -2.310000000000057 | 2.517 | 3.056 | 3.786 |
| -2.305000000000057 | 2.513 | 3.052 | 3.783 |
| -2.300000000000058 | 2.508 | 3.048 | 3.78 |
| -2.295000000000058 | 2.503 | 3.044 | 3.777 |
| -2.290000000000058 | 2.499 | 3.04 | 3.774 |
| -2.285000000000058 | 2.494 | 3.037 | 3.771 |
| -2.280000000000058 | 2.49 | 3.033 | 3.768 |
| -2.275000000000058 | 2.485 | 3.029 | 3.765 |
| -2.270000000000058 | 2.481 | 3.025 | 3.762 |
| -2.265000000000058 | 2.476 | 3.022 | 3.759 |
| -2.260000000000058 | 2.471 | 3.018 | 3.756 |
| -2.255000000000058 | 2.467 | 3.014 | 3.753 |
| -2.250000000000059 | 2.462 | 3.01 | 3.75 |
| -2.245000000000059 | 2.458 | 3.007 | 3.747 |
| -2.240000000000059 | 2.453 | 3.003 | 3.744 |
| -2.235000000000059 | 2.449 | 2.999 | 3.741 |
| -2.23000000000006 | 2.444 | 2.995 | 3.738 |
| -2.22500000000006 | 2.439 | 2.992 | 3.735 |
| -2.22000000000006 | 2.435 | 2.988 | 3.732 |
| -2.215000000000059 | 2.43 | 2.984 | 3.729 |
| -2.210000000000059 | 2.426 | 2.981 | 3.726 |
| -2.20500000000006 | 2.421 | 2.977 | 3.723 |
| -2.20000000000006 | 2.417 | 2.973 | 3.72 |
| -2.19500000000006 | 2.412 | 2.97 | 3.717 |
| -2.19000000000006 | 2.408 | 2.966 | 3.714 |
| -2.18500000000006 | 2.403 | 2.962 | 3.711 |
| -2.18000000000006 | 2.398 | 2.958 | 3.708 |
| -2.17500000000006 | 2.394 | 2.955 | 3.705 |
| -2.17000000000006 | 2.389 | 2.951 | 3.703 |
| -2.16500000000006 | 2.385 | 2.947 | 3.7 |
| -2.160000000000061 | 2.38 | 2.944 | 3.697 |
| -2.155000000000061 | 2.376 | 2.94 | 3.694 |
| -2.150000000000061 | 2.371 | 2.936 | 3.691 |
| -2.145000000000061 | 2.367 | 2.933 | 3.688 |
| -2.140000000000061 | 2.362 | 2.929 | 3.685 |
| -2.135000000000061 | 2.358 | 2.925 | 3.682 |
| -2.130000000000061 | 2.353 | 2.922 | 3.679 |
| -2.125000000000061 | 2.349 | 2.918 | 3.676 |
| -2.120000000000061 | 2.344 | 2.915 | 3.673 |
| -2.115000000000061 | 2.339 | 2.911 | 3.671 |
| -2.110000000000062 | 2.335 | 2.907 | 3.668 |
| -2.105000000000062 | 2.33 | 2.904 | 3.665 |
| -2.100000000000062 | 2.326 | 2.9 | 3.662 |
| -2.095000000000062 | 2.321 | 2.896 | 3.659 |
| -2.090000000000062 | 2.317 | 2.893 | 3.656 |
| -2.085000000000062 | 2.312 | 2.889 | 3.653 |
| -2.080000000000062 | 2.308 | 2.886 | 3.651 |
| -2.075000000000062 | 2.303 | 2.882 | 3.648 |
| -2.070000000000062 | 2.299 | 2.878 | 3.645 |
| -2.065000000000063 | 2.294 | 2.875 | 3.642 |
| -2.060000000000063 | 2.29 | 2.871 | 3.639 |
| -2.055000000000063 | 2.285 | 2.868 | 3.636 |
| -2.050000000000063 | 2.281 | 2.864 | 3.634 |
| -2.045000000000063 | 2.276 | 2.86 | 3.631 |
| -2.040000000000063 | 2.272 | 2.857 | 3.628 |
| -2.035000000000063 | 2.267 | 2.853 | 3.625 |
| -2.030000000000063 | 2.263 | 2.85 | 3.622 |
| -2.025000000000063 | 2.258 | 2.846 | 3.619 |
| -2.020000000000064 | 2.254 | 2.843 | 3.617 |
| -2.015000000000064 | 2.249 | 2.839 | 3.614 |
| -2.010000000000064 | 2.245 | 2.836 | 3.611 |
| -2.005000000000064 | 2.241 | 2.832 | 3.608 |
| -2.000000000000064 | 2.236 | 2.828 | 3.606 |
| -1.995000000000064 | 2.232 | 2.825 | 3.603 |
| -1.990000000000064 | 2.227 | 2.821 | 3.6 |
| -1.985000000000064 | 2.223 | 2.818 | 3.597 |
| -1.980000000000064 | 2.218 | 2.814 | 3.594 |
| -1.975000000000064 | 2.214 | 2.811 | 3.592 |
| -1.970000000000065 | 2.209 | 2.807 | 3.589 |
| -1.965000000000065 | 2.205 | 2.804 | 3.586 |
| -1.960000000000065 | 2.2 | 2.8 | 3.584 |
| -1.955000000000065 | 2.196 | 2.797 | 3.581 |
| -1.950000000000065 | 2.191 | 2.793 | 3.578 |
| -1.945000000000065 | 2.187 | 2.79 | 3.575 |
| -1.940000000000065 | 2.183 | 2.786 | 3.573 |
| -1.935000000000065 | 2.178 | 2.783 | 3.57 |
| -1.930000000000065 | 2.174 | 2.779 | 3.567 |
| -1.925000000000066 | 2.169 | 2.776 | 3.564 |
| -1.920000000000066 | 2.165 | 2.772 | 3.562 |
| -1.915000000000066 | 2.16 | 2.769 | 3.559 |
| -1.910000000000066 | 2.156 | 2.766 | 3.556 |
| -1.905000000000066 | 2.152 | 2.762 | 3.554 |
| -1.900000000000066 | 2.147 | 2.759 | 3.551 |
| -1.895000000000066 | 2.143 | 2.755 | 3.548 |
| -1.890000000000066 | 2.138 | 2.752 | 3.546 |
| -1.885000000000066 | 2.134 | 2.748 | 3.543 |
| -1.880000000000066 | 2.129 | 2.745 | 3.54 |
| -1.875000000000067 | 2.125 | 2.741 | 3.538 |
| -1.870000000000067 | 2.121 | 2.738 | 3.535 |
| -1.865000000000067 | 2.116 | 2.735 | 3.532 |
| -1.860000000000067 | 2.112 | 2.731 | 3.53 |
| -1.855000000000067 | 2.107 | 2.728 | 3.527 |
| -1.850000000000067 | 2.103 | 2.724 | 3.525 |
| -1.845000000000067 | 2.099 | 2.721 | 3.522 |
| -1.840000000000067 | 2.094 | 2.718 | 3.519 |
| -1.835000000000067 | 2.09 | 2.714 | 3.517 |
| -1.830000000000068 | 2.085 | 2.711 | 3.514 |
| -1.825000000000068 | 2.081 | 2.708 | 3.511 |
| -1.820000000000068 | 2.077 | 2.704 | 3.509 |
| -1.815000000000068 | 2.072 | 2.701 | 3.506 |
| -1.810000000000068 | 2.068 | 2.697 | 3.504 |
| -1.805000000000068 | 2.063 | 2.694 | 3.501 |
| -1.800000000000068 | 2.059 | 2.691 | 3.499 |
| -1.795000000000068 | 2.055 | 2.687 | 3.496 |
| -1.790000000000068 | 2.05 | 2.684 | 3.493 |
| -1.785000000000068 | 2.046 | 2.681 | 3.491 |
| -1.780000000000069 | 2.042 | 2.677 | 3.488 |
| -1.775000000000069 | 2.037 | 2.674 | 3.486 |
| -1.770000000000069 | 2.033 | 2.671 | 3.483 |
| -1.765000000000069 | 2.029 | 2.667 | 3.481 |
| -1.760000000000069 | 2.024 | 2.664 | 3.478 |
| -1.75500000000007 | 2.02 | 2.661 | 3.476 |
| -1.75000000000007 | 2.016 | 2.658 | 3.473 |
| -1.745000000000069 | 2.011 | 2.654 | 3.471 |
| -1.740000000000069 | 2.007 | 2.651 | 3.468 |
| -1.73500000000007 | 2.003 | 2.648 | 3.466 |
| -1.73000000000007 | 1.998 | 2.644 | 3.463 |
| -1.72500000000007 | 1.994 | 2.641 | 3.461 |
| -1.72000000000007 | 1.99 | 2.638 | 3.458 |
| -1.71500000000007 | 1.985 | 2.635 | 3.456 |
| -1.71000000000007 | 1.981 | 2.631 | 3.453 |
| -1.70500000000007 | 1.977 | 2.628 | 3.451 |
| -1.70000000000007 | 1.972 | 2.625 | 3.448 |
| -1.69500000000007 | 1.968 | 2.622 | 3.446 |
| -1.69000000000007 | 1.964 | 2.618 | 3.443 |
| -1.685000000000071 | 1.959 | 2.615 | 3.441 |
| -1.680000000000071 | 1.955 | 2.612 | 3.438 |
| -1.675000000000071 | 1.951 | 2.609 | 3.436 |
| -1.670000000000071 | 1.947 | 2.606 | 3.433 |
| -1.665000000000071 | 1.942 | 2.602 | 3.431 |
| -1.660000000000071 | 1.938 | 2.599 | 3.429 |
| -1.655000000000071 | 1.934 | 2.596 | 3.426 |
| -1.650000000000071 | 1.929 | 2.593 | 3.424 |
| -1.645000000000071 | 1.925 | 2.59 | 3.421 |
| -1.640000000000072 | 1.921 | 2.586 | 3.419 |
| -1.635000000000072 | 1.917 | 2.583 | 3.417 |
| -1.630000000000072 | 1.912 | 2.58 | 3.414 |
| -1.625000000000072 | 1.908 | 2.577 | 3.412 |
| -1.620000000000072 | 1.904 | 2.574 | 3.409 |
| -1.615000000000072 | 1.9 | 2.571 | 3.407 |
| -1.610000000000072 | 1.895 | 2.568 | 3.405 |
| -1.605000000000072 | 1.891 | 2.564 | 3.402 |
| -1.600000000000072 | 1.887 | 2.561 | 3.4 |
| -1.595000000000073 | 1.883 | 2.558 | 3.398 |
| -1.590000000000073 | 1.878 | 2.555 | 3.395 |
| -1.585000000000073 | 1.874 | 2.552 | 3.393 |
| -1.580000000000073 | 1.87 | 2.549 | 3.391 |
| -1.575000000000073 | 1.866 | 2.546 | 3.388 |
| -1.570000000000073 | 1.861 | 2.543 | 3.386 |
| -1.565000000000073 | 1.857 | 2.54 | 3.384 |
| -1.560000000000073 | 1.853 | 2.536 | 3.381 |
| -1.555000000000073 | 1.849 | 2.533 | 3.379 |
| -1.550000000000074 | 1.845 | 2.53 | 3.377 |
| -1.545000000000074 | 1.84 | 2.527 | 3.374 |
| -1.540000000000074 | 1.836 | 2.524 | 3.372 |
| -1.535000000000074 | 1.832 | 2.521 | 3.37 |
| -1.530000000000074 | 1.828 | 2.518 | 3.368 |
| -1.525000000000074 | 1.824 | 2.515 | 3.365 |
| -1.520000000000074 | 1.819 | 2.512 | 3.363 |
| -1.515000000000074 | 1.815 | 2.509 | 3.361 |
| -1.510000000000074 | 1.811 | 2.506 | 3.359 |
| -1.505000000000074 | 1.807 | 2.503 | 3.356 |
| -1.500000000000075 | 1.803 | 2.5 | 3.354 |
| -1.495000000000075 | 1.799 | 2.497 | 3.352 |
| -1.490000000000075 | 1.794 | 2.494 | 3.35 |
| -1.485000000000075 | 1.79 | 2.491 | 3.347 |
| -1.480000000000075 | 1.786 | 2.488 | 3.345 |
| -1.475000000000075 | 1.782 | 2.485 | 3.343 |
| -1.470000000000075 | 1.778 | 2.482 | 3.341 |
| -1.465000000000075 | 1.774 | 2.479 | 3.339 |
| -1.460000000000075 | 1.77 | 2.476 | 3.336 |
| -1.455000000000076 | 1.766 | 2.473 | 3.334 |
| -1.450000000000076 | 1.761 | 2.47 | 3.332 |
| -1.445000000000076 | 1.757 | 2.467 | 3.33 |
| -1.440000000000076 | 1.753 | 2.464 | 3.328 |
| -1.435000000000076 | 1.749 | 2.462 | 3.326 |
| -1.430000000000076 | 1.745 | 2.459 | 3.323 |
| -1.425000000000076 | 1.741 | 2.456 | 3.321 |
| -1.420000000000076 | 1.737 | 2.453 | 3.319 |
| -1.415000000000076 | 1.733 | 2.45 | 3.317 |
| -1.410000000000077 | 1.729 | 2.447 | 3.315 |
| -1.405000000000077 | 1.725 | 2.444 | 3.313 |
| -1.400000000000077 | 1.72 | 2.441 | 3.311 |
| -1.395000000000077 | 1.716 | 2.438 | 3.308 |
| -1.390000000000077 | 1.712 | 2.436 | 3.306 |
| -1.385000000000077 | 1.708 | 2.433 | 3.304 |
| -1.380000000000077 | 1.704 | 2.43 | 3.302 |
| -1.375000000000077 | 1.7 | 2.427 | 3.3 |
| -1.370000000000077 | 1.696 | 2.424 | 3.298 |
| -1.365000000000077 | 1.692 | 2.421 | 3.296 |
| -1.360000000000078 | 1.688 | 2.419 | 3.294 |
| -1.355000000000078 | 1.684 | 2.416 | 3.292 |
| -1.350000000000078 | 1.68 | 2.413 | 3.29 |
| -1.345000000000078 | 1.676 | 2.41 | 3.288 |
| -1.340000000000078 | 1.672 | 2.407 | 3.286 |
| -1.335000000000078 | 1.668 | 2.405 | 3.284 |
| -1.330000000000078 | 1.664 | 2.402 | 3.282 |
| -1.325000000000078 | 1.66 | 2.399 | 3.28 |
| -1.320000000000078 | 1.656 | 2.396 | 3.278 |
| -1.315000000000079 | 1.652 | 2.394 | 3.276 |
| -1.310000000000079 | 1.648 | 2.391 | 3.274 |
| -1.305000000000079 | 1.644 | 2.388 | 3.272 |
| -1.300000000000079 | 1.64 | 2.385 | 3.27 |
| -1.295000000000079 | 1.636 | 2.383 | 3.268 |
| -1.29000000000008 | 1.632 | 2.38 | 3.266 |
| -1.285000000000079 | 1.628 | 2.377 | 3.264 |
| -1.280000000000079 | 1.624 | 2.375 | 3.262 |
| -1.275000000000079 | 1.62 | 2.372 | 3.26 |
| -1.270000000000079 | 1.616 | 2.369 | 3.258 |
| -1.26500000000008 | 1.613 | 2.366 | 3.256 |
| -1.26000000000008 | 1.609 | 2.364 | 3.254 |
| -1.25500000000008 | 1.605 | 2.361 | 3.252 |
| -1.25000000000008 | 1.601 | 2.358 | 3.25 |
| -1.24500000000008 | 1.597 | 2.356 | 3.248 |
| -1.24000000000008 | 1.593 | 2.353 | 3.246 |
| -1.23500000000008 | 1.589 | 2.351 | 3.244 |
| -1.23000000000008 | 1.585 | 2.348 | 3.242 |
| -1.22500000000008 | 1.581 | 2.345 | 3.24 |
| -1.220000000000081 | 1.577 | 2.343 | 3.239 |
| -1.215000000000081 | 1.574 | 2.34 | 3.237 |
| -1.210000000000081 | 1.57 | 2.338 | 3.235 |
| -1.205000000000081 | 1.566 | 2.335 | 3.233 |
| -1.200000000000081 | 1.562 | 2.332 | 3.231 |
| -1.195000000000081 | 1.558 | 2.33 | 3.229 |
| -1.190000000000081 | 1.554 | 2.327 | 3.227 |
| -1.185000000000081 | 1.551 | 2.325 | 3.226 |
| -1.180000000000081 | 1.547 | 2.322 | 3.224 |
| -1.175000000000082 | 1.543 | 2.32 | 3.222 |
| -1.170000000000082 | 1.539 | 2.317 | 3.22 |
| -1.165000000000082 | 1.535 | 2.315 | 3.218 |
| -1.160000000000082 | 1.532 | 2.312 | 3.216 |
| -1.155000000000082 | 1.528 | 2.31 | 3.215 |
| -1.150000000000082 | 1.524 | 2.307 | 3.213 |
| -1.145000000000082 | 1.52 | 2.305 | 3.211 |
| -1.140000000000082 | 1.516 | 2.302 | 3.209 |
| -1.135000000000082 | 1.513 | 2.3 | 3.208 |
| -1.130000000000082 | 1.509 | 2.297 | 3.206 |
| -1.125000000000083 | 1.505 | 2.295 | 3.204 |
| -1.120000000000083 | 1.501 | 2.292 | 3.202 |
| -1.115000000000083 | 1.498 | 2.29 | 3.201 |
| -1.110000000000083 | 1.494 | 2.287 | 3.199 |
| -1.105000000000083 | 1.49 | 2.285 | 3.197 |
| -1.100000000000083 | 1.487 | 2.283 | 3.195 |
| -1.095000000000083 | 1.483 | 2.28 | 3.194 |
| -1.090000000000083 | 1.479 | 2.278 | 3.192 |
| -1.085000000000083 | 1.476 | 2.275 | 3.19 |
| -1.080000000000084 | 1.472 | 2.273 | 3.188 |
| -1.075000000000084 | 1.468 | 2.271 | 3.187 |
| -1.070000000000084 | 1.465 | 2.268 | 3.185 |
| -1.065000000000084 | 1.461 | 2.266 | 3.183 |
| -1.060000000000084 | 1.457 | 2.264 | 3.182 |
| -1.055000000000084 | 1.454 | 2.261 | 3.18 |
| -1.050000000000084 | 1.45 | 2.259 | 3.178 |
| -1.045000000000084 | 1.446 | 2.257 | 3.177 |
| -1.040000000000084 | 1.443 | 2.254 | 3.175 |
| -1.035000000000085 | 1.439 | 2.252 | 3.174 |
| -1.030000000000085 | 1.436 | 2.25 | 3.172 |
| -1.025000000000085 | 1.432 | 2.247 | 3.17 |
| -1.020000000000085 | 1.428 | 2.245 | 3.169 |
| -1.015000000000085 | 1.425 | 2.243 | 3.167 |
| -1.010000000000085 | 1.421 | 2.241 | 3.165 |
| -1.005000000000085 | 1.418 | 2.238 | 3.164 |
| -1.000000000000085 | 1.414 | 2.236 | 3.162 |
| -0.995000000000085 | 1.411 | 2.234 | 3.161 |
| -0.990000000000085 | 1.407 | 2.232 | 3.159 |
| -0.985000000000085 | 1.404 | 2.229 | 3.158 |
| -0.980000000000085 | 1.4 | 2.227 | 3.156 |
| -0.975000000000085 | 1.397 | 2.225 | 3.154 |
| -0.970000000000085 | 1.393 | 2.223 | 3.153 |
| -0.965000000000085 | 1.39 | 2.221 | 3.151 |
| -0.960000000000085 | 1.386 | 2.218 | 3.15 |
| -0.955000000000085 | 1.383 | 2.216 | 3.148 |
| -0.950000000000085 | 1.379 | 2.214 | 3.147 |
| -0.945000000000085 | 1.376 | 2.212 | 3.145 |
| -0.940000000000085 | 1.372 | 2.21 | 3.144 |
| -0.935000000000085 | 1.369 | 2.208 | 3.142 |
| -0.930000000000085 | 1.366 | 2.206 | 3.141 |
| -0.925000000000085 | 1.362 | 2.204 | 3.139 |
| -0.920000000000085 | 1.359 | 2.201 | 3.138 |
| -0.915000000000085 | 1.355 | 2.199 | 3.136 |
| -0.910000000000085 | 1.352 | 2.197 | 3.135 |
| -0.905000000000085 | 1.349 | 2.195 | 3.134 |
| -0.900000000000085 | 1.345 | 2.193 | 3.132 |
| -0.895000000000085 | 1.342 | 2.191 | 3.131 |
| -0.890000000000085 | 1.339 | 2.189 | 3.129 |
| -0.885000000000085 | 1.335 | 2.187 | 3.128 |
| -0.880000000000085 | 1.332 | 2.185 | 3.126 |
| -0.875000000000085 | 1.329 | 2.183 | 3.125 |
| -0.870000000000085 | 1.325 | 2.181 | 3.124 |
| -0.865000000000085 | 1.322 | 2.179 | 3.122 |
| -0.860000000000085 | 1.319 | 2.177 | 3.121 |
| -0.855000000000085 | 1.316 | 2.175 | 3.119 |
| -0.850000000000085 | 1.312 | 2.173 | 3.118 |
| -0.845000000000085 | 1.309 | 2.171 | 3.117 |
| -0.840000000000085 | 1.306 | 2.169 | 3.115 |
| -0.835000000000085 | 1.303 | 2.167 | 3.114 |
| -0.830000000000085 | 1.3 | 2.165 | 3.113 |
| -0.825000000000085 | 1.296 | 2.163 | 3.111 |
| -0.820000000000085 | 1.293 | 2.162 | 3.11 |
| -0.815000000000085 | 1.29 | 2.16 | 3.109 |
| -0.810000000000085 | 1.287 | 2.158 | 3.107 |
| -0.805000000000085 | 1.284 | 2.156 | 3.106 |
| -0.800000000000085 | 1.281 | 2.154 | 3.105 |
| -0.795000000000085 | 1.278 | 2.152 | 3.104 |
| -0.790000000000085 | 1.274 | 2.15 | 3.102 |
| -0.785000000000085 | 1.271 | 2.149 | 3.101 |
| -0.780000000000085 | 1.268 | 2.147 | 3.1 |
| -0.775000000000085 | 1.265 | 2.145 | 3.098 |
| -0.770000000000085 | 1.262 | 2.143 | 3.097 |
| -0.765000000000085 | 1.259 | 2.141 | 3.096 |
| -0.760000000000085 | 1.256 | 2.14 | 3.095 |
| -0.755000000000085 | 1.253 | 2.138 | 3.094 |
| -0.750000000000085 | 1.25 | 2.136 | 3.092 |
| -0.745000000000085 | 1.247 | 2.134 | 3.091 |
| -0.740000000000085 | 1.244 | 2.133 | 3.09 |
| -0.735000000000085 | 1.241 | 2.131 | 3.089 |
| -0.730000000000085 | 1.238 | 2.129 | 3.088 |
| -0.725000000000085 | 1.235 | 2.127 | 3.086 |
| -0.720000000000085 | 1.232 | 2.126 | 3.085 |
| -0.715000000000085 | 1.229 | 2.124 | 3.084 |
| -0.710000000000085 | 1.226 | 2.122 | 3.083 |
| -0.705000000000085 | 1.224 | 2.121 | 3.082 |
| -0.700000000000085 | 1.221 | 2.119 | 3.081 |
| -0.695000000000085 | 1.218 | 2.117 | 3.079 |
| -0.690000000000085 | 1.215 | 2.116 | 3.078 |
| -0.685000000000085 | 1.212 | 2.114 | 3.077 |
| -0.680000000000085 | 1.209 | 2.112 | 3.076 |
| -0.675000000000085 | 1.206 | 2.111 | 3.075 |
| -0.670000000000085 | 1.204 | 2.109 | 3.074 |
| -0.665000000000085 | 1.201 | 2.108 | 3.073 |
| -0.660000000000085 | 1.198 | 2.106 | 3.072 |
| -0.655000000000085 | 1.195 | 2.105 | 3.071 |
| -0.650000000000085 | 1.193 | 2.103 | 3.07 |
| -0.645000000000085 | 1.19 | 2.101 | 3.069 |
| -0.640000000000085 | 1.187 | 2.1 | 3.068 |
| -0.635000000000085 | 1.185 | 2.098 | 3.066 |
| -0.630000000000085 | 1.182 | 2.097 | 3.065 |
| -0.625000000000085 | 1.179 | 2.095 | 3.064 |
| -0.620000000000085 | 1.177 | 2.094 | 3.063 |
| -0.615000000000085 | 1.174 | 2.092 | 3.062 |
| -0.610000000000085 | 1.171 | 2.091 | 3.061 |
| -0.605000000000085 | 1.169 | 2.09 | 3.06 |
| -0.600000000000085 | 1.166 | 2.088 | 3.059 |
| -0.595000000000085 | 1.164 | 2.087 | 3.058 |
| -0.590000000000085 | 1.161 | 2.085 | 3.057 |
| -0.585000000000085 | 1.159 | 2.084 | 3.057 |
| -0.580000000000085 | 1.156 | 2.082 | 3.056 |
| -0.575000000000085 | 1.154 | 2.081 | 3.055 |
| -0.570000000000085 | 1.151 | 2.08 | 3.054 |
| -0.565000000000085 | 1.149 | 2.078 | 3.053 |
| -0.560000000000085 | 1.146 | 2.077 | 3.052 |
| -0.555000000000085 | 1.144 | 2.076 | 3.051 |
| -0.550000000000085 | 1.141 | 2.074 | 3.05 |
| -0.545000000000085 | 1.139 | 2.073 | 3.049 |
| -0.540000000000085 | 1.136 | 2.072 | 3.048 |
| -0.535000000000085 | 1.134 | 2.07 | 3.047 |
| -0.530000000000085 | 1.132 | 2.069 | 3.046 |
| -0.525000000000085 | 1.129 | 2.068 | 3.046 |
| -0.520000000000085 | 1.127 | 2.066 | 3.045 |
| -0.515000000000085 | 1.125 | 2.065 | 3.044 |
| -0.510000000000085 | 1.123 | 2.064 | 3.043 |
| -0.505000000000085 | 1.12 | 2.063 | 3.042 |
| -0.500000000000085 | 1.118 | 2.062 | 3.041 |
| -0.495000000000085 | 1.116 | 2.06 | 3.041 |
| -0.490000000000085 | 1.114 | 2.059 | 3.04 |
| -0.485000000000085 | 1.111 | 2.058 | 3.039 |
| -0.480000000000085 | 1.109 | 2.057 | 3.038 |
| -0.475000000000085 | 1.107 | 2.056 | 3.037 |
| -0.470000000000085 | 1.105 | 2.054 | 3.037 |
| -0.465000000000085 | 1.103 | 2.053 | 3.036 |
| -0.460000000000085 | 1.101 | 2.052 | 3.035 |
| -0.455000000000085 | 1.099 | 2.051 | 3.034 |
| -0.450000000000085 | 1.097 | 2.05 | 3.034 |
| -0.445000000000085 | 1.095 | 2.049 | 3.033 |
| -0.440000000000085 | 1.093 | 2.048 | 3.032 |
| -0.435000000000085 | 1.091 | 2.047 | 3.031 |
| -0.430000000000085 | 1.089 | 2.046 | 3.031 |
| -0.425000000000085 | 1.087 | 2.045 | 3.03 |
| -0.420000000000085 | 1.085 | 2.044 | 3.029 |
| -0.415000000000085 | 1.083 | 2.043 | 3.029 |
| -0.410000000000085 | 1.081 | 2.042 | 3.028 |
| -0.405000000000085 | 1.079 | 2.041 | 3.027 |
| -0.400000000000085 | 1.077 | 2.04 | 3.027 |
| -0.395000000000085 | 1.075 | 2.039 | 3.026 |
| -0.390000000000085 | 1.073 | 2.038 | 3.025 |
| -0.385000000000085 | 1.072 | 2.037 | 3.025 |
| -0.380000000000085 | 1.07 | 2.036 | 3.024 |
| -0.375000000000085 | 1.068 | 2.035 | 3.023 |
| -0.370000000000085 | 1.066 | 2.034 | 3.023 |
| -0.365000000000085 | 1.065 | 2.033 | 3.022 |
| -0.360000000000085 | 1.063 | 2.032 | 3.022 |
| -0.355000000000085 | 1.061 | 2.031 | 3.021 |
| -0.350000000000085 | 1.059 | 2.03 | 3.02 |
| -0.345000000000085 | 1.058 | 2.03 | 3.02 |
| -0.340000000000085 | 1.056 | 2.029 | 3.019 |
| -0.335000000000085 | 1.055 | 2.028 | 3.019 |
| -0.330000000000085 | 1.053 | 2.027 | 3.018 |
| -0.325000000000085 | 1.051 | 2.026 | 3.018 |
| -0.320000000000085 | 1.05 | 2.025 | 3.017 |
| -0.315000000000085 | 1.048 | 2.025 | 3.016 |
| -0.310000000000085 | 1.047 | 2.024 | 3.016 |
| -0.305000000000085 | 1.045 | 2.023 | 3.015 |
| -0.300000000000085 | 1.044 | 2.022 | 3.015 |
| -0.295000000000085 | 1.043 | 2.022 | 3.014 |
| -0.290000000000085 | 1.041 | 2.021 | 3.014 |
| -0.285000000000085 | 1.04 | 2.02 | 3.014 |
| -0.280000000000085 | 1.038 | 2.02 | 3.013 |
| -0.275000000000085 | 1.037 | 2.019 | 3.013 |
| -0.270000000000085 | 1.036 | 2.018 | 3.012 |
| -0.265000000000085 | 1.035 | 2.017 | 3.012 |
| -0.260000000000085 | 1.033 | 2.017 | 3.011 |
| -0.255000000000085 | 1.032 | 2.016 | 3.011 |
| -0.250000000000085 | 1.031 | 2.016 | 3.01 |
| -0.245000000000085 | 1.03 | 2.015 | 3.01 |
| -0.240000000000085 | 1.028 | 2.014 | 3.01 |
| -0.235000000000085 | 1.027 | 2.014 | 3.009 |
| -0.230000000000085 | 1.026 | 2.013 | 3.009 |
| -0.225000000000085 | 1.025 | 2.013 | 3.008 |
| -0.220000000000085 | 1.024 | 2.012 | 3.008 |
| -0.215000000000085 | 1.023 | 2.012 | 3.008 |
| -0.210000000000085 | 1.022 | 2.011 | 3.007 |
| -0.205000000000085 | 1.021 | 2.01 | 3.007 |
| -0.200000000000085 | 1.02 | 2.01 | 3.007 |
| -0.195000000000085 | 1.019 | 2.009 | 3.006 |
| -0.190000000000085 | 1.018 | 2.009 | 3.006 |
| -0.185000000000085 | 1.017 | 2.009 | 3.006 |
| -0.180000000000085 | 1.016 | 2.008 | 3.005 |
| -0.175000000000085 | 1.015 | 2.008 | 3.005 |
| -0.170000000000085 | 1.014 | 2.007 | 3.005 |
| -0.165000000000085 | 1.014 | 2.007 | 3.005 |
| -0.160000000000085 | 1.013 | 2.006 | 3.004 |
| -0.155000000000084 | 1.012 | 2.006 | 3.004 |
| -0.150000000000084 | 1.011 | 2.006 | 3.004 |
| -0.145000000000084 | 1.01 | 2.005 | 3.004 |
| -0.140000000000084 | 1.01 | 2.005 | 3.003 |
| -0.135000000000084 | 1.009 | 2.005 | 3.003 |
| -0.130000000000084 | 1.008 | 2.004 | 3.003 |
| -0.125000000000084 | 1.008 | 2.004 | 3.003 |
| -0.120000000000084 | 1.007 | 2.004 | 3.002 |
| -0.115000000000084 | 1.007 | 2.003 | 3.002 |
| -0.110000000000084 | 1.006 | 2.003 | 3.002 |
| -0.105000000000084 | 1.005 | 2.003 | 3.002 |
| -0.100000000000084 | 1.005 | 2.002 | 3.002 |
| -0.0950000000000844 | 1.005 | 2.002 | 3.002 |
| -0.0900000000000844 | 1.004 | 2.002 | 3.001 |
| -0.0850000000000844 | 1.004 | 2.002 | 3.001 |
| -0.0800000000000844 | 1.003 | 2.002 | 3.001 |
| -0.0750000000000844 | 1.003 | 2.001 | 3.001 |
| -0.0700000000000844 | 1.002 | 2.001 | 3.001 |
| -0.0650000000000844 | 1.002 | 2.001 | 3.001 |
| -0.0600000000000844 | 1.002 | 2.001 | 3.001 |
| -0.0550000000000844 | 1.002 | 2.001 | 3.001 |
| -0.0500000000000844 | 1.001 | 2.001 | 3 |
| -0.0450000000000844 | 1.001 | 2.001 | 3 |
| -0.0400000000000844 | 1.001 | 2 | 3 |
| -0.0350000000000844 | 1.001 | 2 | 3 |
| -0.0300000000000844 | 1 | 2 | 3 |
| -0.0250000000000844 | 1 | 2 | 3 |
| -0.0200000000000844 | 1 | 2 | 3 |
| -0.0150000000000844 | 1 | 2 | 3 |
| -0.0100000000000844 | 1 | 2 | 3 |
| -0.00500000000008444 | 1 | 2 | 3 |
| -8.4444604087075e-14 | 1 | 2 | 3 |
| 0.00499999999991555 | 1 | 2 | 3 |
| 0.00999999999991555 | 1 | 2 | 3 |
| 0.0149999999999156 | 1 | 2 | 3 |
| 0.0199999999999156 | 1 | 2 | 3 |
| 0.0249999999999156 | 1 | 2 | 3 |
| 0.0299999999999156 | 1 | 2 | 3 |
| 0.0349999999999155 | 1.001 | 2 | 3 |
| 0.0399999999999155 | 1.001 | 2 | 3 |
| 0.0449999999999155 | 1.001 | 2.001 | 3 |
| 0.0499999999999155 | 1.001 | 2.001 | 3 |
| 0.0549999999999155 | 1.002 | 2.001 | 3.001 |
| 0.0599999999999155 | 1.002 | 2.001 | 3.001 |
| 0.0649999999999155 | 1.002 | 2.001 | 3.001 |
| 0.0699999999999155 | 1.002 | 2.001 | 3.001 |
| 0.0749999999999155 | 1.003 | 2.001 | 3.001 |
| 0.0799999999999155 | 1.003 | 2.002 | 3.001 |
| 0.0849999999999155 | 1.004 | 2.002 | 3.001 |
| 0.0899999999999155 | 1.004 | 2.002 | 3.001 |
| 0.0949999999999155 | 1.005 | 2.002 | 3.002 |
| 0.0999999999999155 | 1.005 | 2.002 | 3.002 |
| 0.104999999999916 | 1.005 | 2.003 | 3.002 |
| 0.109999999999916 | 1.006 | 2.003 | 3.002 |
| 0.114999999999916 | 1.007 | 2.003 | 3.002 |
| 0.119999999999916 | 1.007 | 2.004 | 3.002 |
| 0.124999999999916 | 1.008 | 2.004 | 3.003 |
| 0.129999999999916 | 1.008 | 2.004 | 3.003 |
| 0.134999999999916 | 1.009 | 2.005 | 3.003 |
| 0.139999999999916 | 1.01 | 2.005 | 3.003 |
| 0.144999999999916 | 1.01 | 2.005 | 3.004 |
| 0.149999999999916 | 1.011 | 2.006 | 3.004 |
| 0.154999999999916 | 1.012 | 2.006 | 3.004 |
| 0.159999999999916 | 1.013 | 2.006 | 3.004 |
| 0.164999999999916 | 1.014 | 2.007 | 3.005 |
| 0.169999999999916 | 1.014 | 2.007 | 3.005 |
| 0.174999999999916 | 1.015 | 2.008 | 3.005 |
| 0.179999999999916 | 1.016 | 2.008 | 3.005 |
| 0.184999999999916 | 1.017 | 2.009 | 3.006 |
| 0.189999999999916 | 1.018 | 2.009 | 3.006 |
| 0.194999999999916 | 1.019 | 2.009 | 3.006 |
| 0.199999999999916 | 1.02 | 2.01 | 3.007 |
| 0.204999999999916 | 1.021 | 2.01 | 3.007 |
| 0.209999999999916 | 1.022 | 2.011 | 3.007 |
| 0.214999999999916 | 1.023 | 2.012 | 3.008 |
| 0.219999999999916 | 1.024 | 2.012 | 3.008 |
| 0.224999999999916 | 1.025 | 2.013 | 3.008 |
| 0.229999999999916 | 1.026 | 2.013 | 3.009 |
| 0.234999999999916 | 1.027 | 2.014 | 3.009 |
| 0.239999999999916 | 1.028 | 2.014 | 3.01 |
| 0.244999999999916 | 1.03 | 2.015 | 3.01 |
| 0.249999999999916 | 1.031 | 2.016 | 3.01 |
| 0.254999999999916 | 1.032 | 2.016 | 3.011 |
| 0.259999999999916 | 1.033 | 2.017 | 3.011 |
| 0.264999999999916 | 1.035 | 2.017 | 3.012 |
| 0.269999999999916 | 1.036 | 2.018 | 3.012 |
| 0.274999999999916 | 1.037 | 2.019 | 3.013 |
| 0.279999999999916 | 1.038 | 2.02 | 3.013 |
| 0.284999999999916 | 1.04 | 2.02 | 3.014 |
| 0.289999999999916 | 1.041 | 2.021 | 3.014 |
| 0.294999999999916 | 1.043 | 2.022 | 3.014 |
| 0.299999999999916 | 1.044 | 2.022 | 3.015 |
| 0.304999999999916 | 1.045 | 2.023 | 3.015 |
| 0.309999999999916 | 1.047 | 2.024 | 3.016 |
| 0.314999999999916 | 1.048 | 2.025 | 3.016 |
| 0.319999999999916 | 1.05 | 2.025 | 3.017 |
| 0.324999999999916 | 1.051 | 2.026 | 3.018 |
| 0.329999999999916 | 1.053 | 2.027 | 3.018 |
| 0.334999999999916 | 1.055 | 2.028 | 3.019 |
| 0.339999999999916 | 1.056 | 2.029 | 3.019 |
| 0.344999999999916 | 1.058 | 2.03 | 3.02 |
| 0.349999999999916 | 1.059 | 2.03 | 3.02 |
| 0.354999999999916 | 1.061 | 2.031 | 3.021 |
| 0.359999999999916 | 1.063 | 2.032 | 3.022 |
| 0.364999999999916 | 1.065 | 2.033 | 3.022 |
| 0.369999999999916 | 1.066 | 2.034 | 3.023 |
| 0.374999999999916 | 1.068 | 2.035 | 3.023 |
| 0.379999999999916 | 1.07 | 2.036 | 3.024 |
| 0.384999999999916 | 1.072 | 2.037 | 3.025 |
| 0.389999999999916 | 1.073 | 2.038 | 3.025 |
| 0.394999999999916 | 1.075 | 2.039 | 3.026 |
| 0.399999999999916 | 1.077 | 2.04 | 3.027 |
| 0.404999999999916 | 1.079 | 2.041 | 3.027 |
| 0.409999999999916 | 1.081 | 2.042 | 3.028 |
| 0.414999999999916 | 1.083 | 2.043 | 3.029 |
| 0.419999999999916 | 1.085 | 2.044 | 3.029 |
| 0.424999999999916 | 1.087 | 2.045 | 3.03 |
| 0.429999999999916 | 1.089 | 2.046 | 3.031 |
| 0.434999999999916 | 1.091 | 2.047 | 3.031 |
| 0.439999999999916 | 1.093 | 2.048 | 3.032 |
| 0.444999999999916 | 1.095 | 2.049 | 3.033 |
| 0.449999999999916 | 1.097 | 2.05 | 3.034 |
| 0.454999999999916 | 1.099 | 2.051 | 3.034 |
| 0.459999999999916 | 1.101 | 2.052 | 3.035 |
| 0.464999999999916 | 1.103 | 2.053 | 3.036 |
| 0.469999999999916 | 1.105 | 2.054 | 3.037 |
| 0.474999999999916 | 1.107 | 2.056 | 3.037 |
| 0.479999999999916 | 1.109 | 2.057 | 3.038 |
| 0.484999999999916 | 1.111 | 2.058 | 3.039 |
| 0.489999999999916 | 1.114 | 2.059 | 3.04 |
| 0.494999999999916 | 1.116 | 2.06 | 3.041 |
| 0.499999999999916 | 1.118 | 2.062 | 3.041 |
| 0.504999999999916 | 1.12 | 2.063 | 3.042 |
| 0.509999999999916 | 1.123 | 2.064 | 3.043 |
| 0.514999999999916 | 1.125 | 2.065 | 3.044 |
| 0.519999999999916 | 1.127 | 2.066 | 3.045 |
| 0.524999999999916 | 1.129 | 2.068 | 3.046 |
| 0.529999999999916 | 1.132 | 2.069 | 3.046 |
| 0.534999999999916 | 1.134 | 2.07 | 3.047 |
| 0.539999999999916 | 1.136 | 2.072 | 3.048 |
| 0.544999999999916 | 1.139 | 2.073 | 3.049 |
| 0.549999999999916 | 1.141 | 2.074 | 3.05 |
| 0.554999999999916 | 1.144 | 2.076 | 3.051 |
| 0.559999999999916 | 1.146 | 2.077 | 3.052 |
| 0.564999999999916 | 1.149 | 2.078 | 3.053 |
| 0.569999999999916 | 1.151 | 2.08 | 3.054 |
| 0.574999999999916 | 1.154 | 2.081 | 3.055 |
| 0.579999999999916 | 1.156 | 2.082 | 3.056 |
| 0.584999999999916 | 1.159 | 2.084 | 3.057 |
| 0.589999999999916 | 1.161 | 2.085 | 3.057 |
| 0.594999999999916 | 1.164 | 2.087 | 3.058 |
| 0.599999999999916 | 1.166 | 2.088 | 3.059 |
| 0.604999999999916 | 1.169 | 2.09 | 3.06 |
| 0.609999999999916 | 1.171 | 2.091 | 3.061 |
| 0.614999999999916 | 1.174 | 2.092 | 3.062 |
| 0.619999999999916 | 1.177 | 2.094 | 3.063 |
| 0.624999999999916 | 1.179 | 2.095 | 3.064 |
| 0.629999999999916 | 1.182 | 2.097 | 3.065 |
| 0.634999999999916 | 1.185 | 2.098 | 3.066 |
| 0.639999999999916 | 1.187 | 2.1 | 3.068 |
| 0.644999999999916 | 1.19 | 2.101 | 3.069 |
| 0.649999999999916 | 1.193 | 2.103 | 3.07 |
| 0.654999999999916 | 1.195 | 2.105 | 3.071 |
| 0.659999999999916 | 1.198 | 2.106 | 3.072 |
| 0.664999999999916 | 1.201 | 2.108 | 3.073 |
| 0.669999999999916 | 1.204 | 2.109 | 3.074 |
| 0.674999999999916 | 1.206 | 2.111 | 3.075 |
| 0.679999999999916 | 1.209 | 2.112 | 3.076 |
| 0.684999999999916 | 1.212 | 2.114 | 3.077 |
| 0.689999999999916 | 1.215 | 2.116 | 3.078 |
| 0.694999999999916 | 1.218 | 2.117 | 3.079 |
| 0.699999999999916 | 1.221 | 2.119 | 3.081 |
| 0.704999999999916 | 1.224 | 2.121 | 3.082 |
| 0.709999999999916 | 1.226 | 2.122 | 3.083 |
| 0.714999999999916 | 1.229 | 2.124 | 3.084 |
| 0.719999999999916 | 1.232 | 2.126 | 3.085 |
| 0.724999999999916 | 1.235 | 2.127 | 3.086 |
| 0.729999999999916 | 1.238 | 2.129 | 3.088 |
| 0.734999999999916 | 1.241 | 2.131 | 3.089 |
| 0.739999999999916 | 1.244 | 2.133 | 3.09 |
| 0.744999999999916 | 1.247 | 2.134 | 3.091 |
| 0.749999999999916 | 1.25 | 2.136 | 3.092 |
| 0.754999999999916 | 1.253 | 2.138 | 3.094 |
| 0.759999999999916 | 1.256 | 2.14 | 3.095 |
| 0.764999999999916 | 1.259 | 2.141 | 3.096 |
| 0.769999999999916 | 1.262 | 2.143 | 3.097 |
| 0.774999999999916 | 1.265 | 2.145 | 3.098 |
| 0.779999999999916 | 1.268 | 2.147 | 3.1 |
| 0.784999999999916 | 1.271 | 2.149 | 3.101 |
| 0.789999999999916 | 1.274 | 2.15 | 3.102 |
| 0.794999999999916 | 1.278 | 2.152 | 3.104 |
| 0.799999999999916 | 1.281 | 2.154 | 3.105 |
| 0.804999999999916 | 1.284 | 2.156 | 3.106 |
| 0.809999999999916 | 1.287 | 2.158 | 3.107 |
| 0.814999999999916 | 1.29 | 2.16 | 3.109 |
| 0.819999999999916 | 1.293 | 2.162 | 3.11 |
| 0.824999999999916 | 1.296 | 2.163 | 3.111 |
| 0.829999999999916 | 1.3 | 2.165 | 3.113 |
| 0.834999999999916 | 1.303 | 2.167 | 3.114 |
| 0.839999999999916 | 1.306 | 2.169 | 3.115 |
| 0.844999999999916 | 1.309 | 2.171 | 3.117 |
| 0.849999999999916 | 1.312 | 2.173 | 3.118 |
| 0.854999999999916 | 1.316 | 2.175 | 3.119 |
| 0.859999999999916 | 1.319 | 2.177 | 3.121 |
| 0.864999999999916 | 1.322 | 2.179 | 3.122 |
| 0.869999999999916 | 1.325 | 2.181 | 3.124 |
| 0.874999999999916 | 1.329 | 2.183 | 3.125 |
| 0.879999999999916 | 1.332 | 2.185 | 3.126 |
| 0.884999999999916 | 1.335 | 2.187 | 3.128 |
| 0.889999999999916 | 1.339 | 2.189 | 3.129 |
| 0.894999999999916 | 1.342 | 2.191 | 3.131 |
| 0.899999999999916 | 1.345 | 2.193 | 3.132 |
| 0.904999999999916 | 1.349 | 2.195 | 3.134 |
| 0.909999999999916 | 1.352 | 2.197 | 3.135 |
| 0.914999999999916 | 1.355 | 2.199 | 3.136 |
| 0.919999999999916 | 1.359 | 2.201 | 3.138 |
| 0.924999999999916 | 1.362 | 2.204 | 3.139 |
| 0.929999999999916 | 1.366 | 2.206 | 3.141 |
| 0.934999999999916 | 1.369 | 2.208 | 3.142 |
| 0.939999999999916 | 1.372 | 2.21 | 3.144 |
| 0.944999999999916 | 1.376 | 2.212 | 3.145 |
| 0.949999999999916 | 1.379 | 2.214 | 3.147 |
| 0.954999999999916 | 1.383 | 2.216 | 3.148 |
| 0.959999999999916 | 1.386 | 2.218 | 3.15 |
| 0.964999999999916 | 1.39 | 2.221 | 3.151 |
| 0.969999999999916 | 1.393 | 2.223 | 3.153 |
| 0.974999999999916 | 1.397 | 2.225 | 3.154 |
| 0.979999999999916 | 1.4 | 2.227 | 3.156 |
| 0.984999999999916 | 1.404 | 2.229 | 3.158 |
| 0.989999999999916 | 1.407 | 2.232 | 3.159 |
| 0.994999999999916 | 1.411 | 2.234 | 3.161 |
| 0.999999999999916 | 1.414 | 2.236 | 3.162 |
| 1.004999999999916 | 1.418 | 2.238 | 3.164 |
| 1.009999999999916 | 1.421 | 2.241 | 3.165 |
| 1.014999999999916 | 1.425 | 2.243 | 3.167 |
| 1.019999999999916 | 1.428 | 2.245 | 3.169 |
| 1.024999999999916 | 1.432 | 2.247 | 3.17 |
| 1.029999999999916 | 1.436 | 2.25 | 3.172 |
| 1.034999999999916 | 1.439 | 2.252 | 3.174 |
| 1.039999999999915 | 1.443 | 2.254 | 3.175 |
| 1.044999999999915 | 1.446 | 2.257 | 3.177 |
| 1.049999999999915 | 1.45 | 2.259 | 3.178 |
| 1.054999999999915 | 1.454 | 2.261 | 3.18 |
| 1.059999999999915 | 1.457 | 2.264 | 3.182 |
| 1.064999999999915 | 1.461 | 2.266 | 3.183 |
| 1.069999999999915 | 1.465 | 2.268 | 3.185 |
| 1.074999999999915 | 1.468 | 2.271 | 3.187 |
| 1.079999999999915 | 1.472 | 2.273 | 3.188 |
| 1.084999999999914 | 1.476 | 2.275 | 3.19 |
| 1.089999999999914 | 1.479 | 2.278 | 3.192 |
| 1.094999999999914 | 1.483 | 2.28 | 3.194 |
| 1.099999999999914 | 1.487 | 2.283 | 3.195 |
| 1.104999999999914 | 1.49 | 2.285 | 3.197 |
| 1.109999999999914 | 1.494 | 2.287 | 3.199 |
| 1.114999999999914 | 1.498 | 2.29 | 3.201 |
| 1.119999999999914 | 1.501 | 2.292 | 3.202 |
| 1.124999999999914 | 1.505 | 2.295 | 3.204 |
| 1.129999999999914 | 1.509 | 2.297 | 3.206 |
| 1.134999999999913 | 1.513 | 2.3 | 3.208 |
| 1.139999999999913 | 1.516 | 2.302 | 3.209 |
| 1.144999999999913 | 1.52 | 2.305 | 3.211 |
| 1.149999999999913 | 1.524 | 2.307 | 3.213 |
| 1.154999999999913 | 1.528 | 2.31 | 3.215 |
| 1.159999999999913 | 1.532 | 2.312 | 3.216 |
| 1.164999999999913 | 1.535 | 2.315 | 3.218 |
| 1.169999999999913 | 1.539 | 2.317 | 3.22 |
| 1.174999999999913 | 1.543 | 2.32 | 3.222 |
| 1.179999999999912 | 1.547 | 2.322 | 3.224 |
| 1.184999999999912 | 1.551 | 2.325 | 3.226 |
| 1.189999999999912 | 1.554 | 2.327 | 3.227 |
| 1.194999999999912 | 1.558 | 2.33 | 3.229 |
| 1.199999999999912 | 1.562 | 2.332 | 3.231 |
| 1.204999999999912 | 1.566 | 2.335 | 3.233 |
| 1.209999999999912 | 1.57 | 2.338 | 3.235 |
| 1.214999999999912 | 1.574 | 2.34 | 3.237 |
| 1.219999999999912 | 1.577 | 2.343 | 3.239 |
| 1.224999999999911 | 1.581 | 2.345 | 3.24 |
| 1.229999999999911 | 1.585 | 2.348 | 3.242 |
| 1.234999999999911 | 1.589 | 2.351 | 3.244 |
| 1.239999999999911 | 1.593 | 2.353 | 3.246 |
| 1.244999999999911 | 1.597 | 2.356 | 3.248 |
| 1.249999999999911 | 1.601 | 2.358 | 3.25 |
| 1.254999999999911 | 1.605 | 2.361 | 3.252 |
| 1.259999999999911 | 1.609 | 2.364 | 3.254 |
| 1.264999999999911 | 1.613 | 2.366 | 3.256 |
| 1.269999999999911 | 1.616 | 2.369 | 3.258 |
| 1.27499999999991 | 1.62 | 2.372 | 3.26 |
| 1.27999999999991 | 1.624 | 2.375 | 3.262 |
| 1.28499999999991 | 1.628 | 2.377 | 3.264 |
| 1.28999999999991 | 1.632 | 2.38 | 3.266 |
| 1.29499999999991 | 1.636 | 2.383 | 3.268 |
| 1.29999999999991 | 1.64 | 2.385 | 3.27 |
| 1.30499999999991 | 1.644 | 2.388 | 3.272 |
| 1.30999999999991 | 1.648 | 2.391 | 3.274 |
| 1.31499999999991 | 1.652 | 2.394 | 3.276 |
| 1.319999999999909 | 1.656 | 2.396 | 3.278 |
| 1.324999999999909 | 1.66 | 2.399 | 3.28 |
| 1.329999999999909 | 1.664 | 2.402 | 3.282 |
| 1.334999999999909 | 1.668 | 2.405 | 3.284 |
| 1.339999999999909 | 1.672 | 2.407 | 3.286 |
| 1.344999999999909 | 1.676 | 2.41 | 3.288 |
| 1.349999999999909 | 1.68 | 2.413 | 3.29 |
| 1.354999999999909 | 1.684 | 2.416 | 3.292 |
| 1.359999999999909 | 1.688 | 2.419 | 3.294 |
| 1.364999999999908 | 1.692 | 2.421 | 3.296 |
| 1.369999999999908 | 1.696 | 2.424 | 3.298 |
| 1.374999999999908 | 1.7 | 2.427 | 3.3 |
| 1.379999999999908 | 1.704 | 2.43 | 3.302 |
| 1.384999999999908 | 1.708 | 2.433 | 3.304 |
| 1.389999999999908 | 1.712 | 2.436 | 3.306 |
| 1.394999999999908 | 1.716 | 2.438 | 3.308 |
| 1.399999999999908 | 1.72 | 2.441 | 3.311 |
| 1.404999999999908 | 1.725 | 2.444 | 3.313 |
| 1.409999999999908 | 1.729 | 2.447 | 3.315 |
| 1.414999999999907 | 1.733 | 2.45 | 3.317 |
| 1.419999999999907 | 1.737 | 2.453 | 3.319 |
| 1.424999999999907 | 1.741 | 2.456 | 3.321 |
| 1.429999999999907 | 1.745 | 2.459 | 3.323 |
| 1.434999999999907 | 1.749 | 2.462 | 3.326 |
| 1.439999999999907 | 1.753 | 2.464 | 3.328 |
| 1.444999999999907 | 1.757 | 2.467 | 3.33 |
| 1.449999999999907 | 1.761 | 2.47 | 3.332 |
| 1.454999999999907 | 1.766 | 2.473 | 3.334 |
| 1.459999999999906 | 1.77 | 2.476 | 3.336 |
| 1.464999999999906 | 1.774 | 2.479 | 3.339 |
| 1.469999999999906 | 1.778 | 2.482 | 3.341 |
| 1.474999999999906 | 1.782 | 2.485 | 3.343 |
| 1.479999999999906 | 1.786 | 2.488 | 3.345 |
| 1.484999999999906 | 1.79 | 2.491 | 3.347 |
| 1.489999999999906 | 1.794 | 2.494 | 3.35 |
| 1.494999999999906 | 1.799 | 2.497 | 3.352 |
| 1.499999999999906 | 1.803 | 2.5 | 3.354 |
| 1.504999999999906 | 1.807 | 2.503 | 3.356 |
| 1.509999999999905 | 1.811 | 2.506 | 3.359 |
| 1.514999999999905 | 1.815 | 2.509 | 3.361 |
| 1.519999999999905 | 1.819 | 2.512 | 3.363 |
| 1.524999999999905 | 1.824 | 2.515 | 3.365 |
| 1.529999999999905 | 1.828 | 2.518 | 3.368 |
| 1.534999999999905 | 1.832 | 2.521 | 3.37 |
| 1.539999999999905 | 1.836 | 2.524 | 3.372 |
| 1.544999999999905 | 1.84 | 2.527 | 3.374 |
| 1.549999999999905 | 1.845 | 2.53 | 3.377 |
| 1.554999999999904 | 1.849 | 2.533 | 3.379 |
| 1.559999999999904 | 1.853 | 2.536 | 3.381 |
| 1.564999999999904 | 1.857 | 2.54 | 3.384 |
| 1.569999999999904 | 1.861 | 2.543 | 3.386 |
| 1.574999999999904 | 1.866 | 2.546 | 3.388 |
| 1.579999999999904 | 1.87 | 2.549 | 3.391 |
| 1.584999999999904 | 1.874 | 2.552 | 3.393 |
| 1.589999999999904 | 1.878 | 2.555 | 3.395 |
| 1.594999999999904 | 1.883 | 2.558 | 3.398 |
| 1.599999999999903 | 1.887 | 2.561 | 3.4 |
| 1.604999999999903 | 1.891 | 2.564 | 3.402 |
| 1.609999999999903 | 1.895 | 2.568 | 3.405 |
| 1.614999999999903 | 1.9 | 2.571 | 3.407 |
| 1.619999999999903 | 1.904 | 2.574 | 3.409 |
| 1.624999999999903 | 1.908 | 2.577 | 3.412 |
| 1.629999999999903 | 1.912 | 2.58 | 3.414 |
| 1.634999999999903 | 1.917 | 2.583 | 3.417 |
| 1.639999999999903 | 1.921 | 2.586 | 3.419 |
| 1.644999999999902 | 1.925 | 2.59 | 3.421 |
| 1.649999999999902 | 1.929 | 2.593 | 3.424 |
| 1.654999999999902 | 1.934 | 2.596 | 3.426 |
| 1.659999999999902 | 1.938 | 2.599 | 3.429 |
| 1.664999999999902 | 1.942 | 2.602 | 3.431 |
| 1.669999999999902 | 1.947 | 2.606 | 3.433 |
| 1.674999999999902 | 1.951 | 2.609 | 3.436 |
| 1.679999999999902 | 1.955 | 2.612 | 3.438 |
| 1.684999999999902 | 1.959 | 2.615 | 3.441 |
| 1.689999999999901 | 1.964 | 2.618 | 3.443 |
| 1.694999999999901 | 1.968 | 2.622 | 3.446 |
| 1.699999999999901 | 1.972 | 2.625 | 3.448 |
| 1.704999999999901 | 1.977 | 2.628 | 3.451 |
| 1.709999999999901 | 1.981 | 2.631 | 3.453 |
| 1.714999999999901 | 1.985 | 2.635 | 3.456 |
| 1.719999999999901 | 1.99 | 2.638 | 3.458 |
| 1.724999999999901 | 1.994 | 2.641 | 3.461 |
| 1.729999999999901 | 1.998 | 2.644 | 3.463 |
| 1.734999999999901 | 2.003 | 2.648 | 3.466 |
| 1.7399999999999 | 2.007 | 2.651 | 3.468 |
| 1.7449999999999 | 2.011 | 2.654 | 3.471 |
| 1.7499999999999 | 2.016 | 2.658 | 3.473 |
| 1.7549999999999 | 2.02 | 2.661 | 3.476 |
| 1.7599999999999 | 2.024 | 2.664 | 3.478 |
| 1.7649999999999 | 2.029 | 2.667 | 3.481 |
| 1.7699999999999 | 2.033 | 2.671 | 3.483 |
| 1.7749999999999 | 2.037 | 2.674 | 3.486 |
| 1.7799999999999 | 2.042 | 2.677 | 3.488 |
| 1.784999999999899 | 2.046 | 2.681 | 3.491 |
| 1.789999999999899 | 2.05 | 2.684 | 3.493 |
| 1.794999999999899 | 2.055 | 2.687 | 3.496 |
| 1.799999999999899 | 2.059 | 2.691 | 3.499 |
| 1.804999999999899 | 2.063 | 2.694 | 3.501 |
| 1.809999999999899 | 2.068 | 2.697 | 3.504 |
| 1.814999999999899 | 2.072 | 2.701 | 3.506 |
| 1.819999999999899 | 2.077 | 2.704 | 3.509 |
| 1.824999999999899 | 2.081 | 2.708 | 3.511 |
| 1.829999999999899 | 2.085 | 2.711 | 3.514 |
| 1.834999999999898 | 2.09 | 2.714 | 3.517 |
| 1.839999999999898 | 2.094 | 2.718 | 3.519 |
| 1.844999999999898 | 2.099 | 2.721 | 3.522 |
| 1.849999999999898 | 2.103 | 2.724 | 3.525 |
| 1.854999999999898 | 2.107 | 2.728 | 3.527 |
| 1.859999999999898 | 2.112 | 2.731 | 3.53 |
| 1.864999999999898 | 2.116 | 2.735 | 3.532 |
| 1.869999999999898 | 2.121 | 2.738 | 3.535 |
| 1.874999999999898 | 2.125 | 2.741 | 3.538 |
| 1.879999999999897 | 2.129 | 2.745 | 3.54 |
| 1.884999999999897 | 2.134 | 2.748 | 3.543 |
| 1.889999999999897 | 2.138 | 2.752 | 3.546 |
| 1.894999999999897 | 2.143 | 2.755 | 3.548 |
| 1.899999999999897 | 2.147 | 2.759 | 3.551 |
| 1.904999999999897 | 2.152 | 2.762 | 3.554 |
| 1.909999999999897 | 2.156 | 2.766 | 3.556 |
| 1.914999999999897 | 2.16 | 2.769 | 3.559 |
| 1.919999999999897 | 2.165 | 2.772 | 3.562 |
| 1.924999999999897 | 2.169 | 2.776 | 3.564 |
| 1.929999999999896 | 2.174 | 2.779 | 3.567 |
| 1.934999999999896 | 2.178 | 2.783 | 3.57 |
| 1.939999999999896 | 2.183 | 2.786 | 3.573 |
| 1.944999999999896 | 2.187 | 2.79 | 3.575 |
| 1.949999999999896 | 2.191 | 2.793 | 3.578 |
| 1.954999999999896 | 2.196 | 2.797 | 3.581 |
| 1.959999999999896 | 2.2 | 2.8 | 3.584 |
| 1.964999999999896 | 2.205 | 2.804 | 3.586 |
| 1.969999999999896 | 2.209 | 2.807 | 3.589 |
| 1.974999999999895 | 2.214 | 2.811 | 3.592 |
| 1.979999999999895 | 2.218 | 2.814 | 3.594 |
| 1.984999999999895 | 2.223 | 2.818 | 3.597 |
| 1.989999999999895 | 2.227 | 2.821 | 3.6 |
| 1.994999999999895 | 2.232 | 2.825 | 3.603 |
| 1.999999999999895 | 2.236 | 2.828 | 3.606 |
| 2.004999999999895 | 2.241 | 2.832 | 3.608 |
| 2.009999999999895 | 2.245 | 2.836 | 3.611 |
| 2.014999999999895 | 2.249 | 2.839 | 3.614 |
| 2.019999999999895 | 2.254 | 2.843 | 3.617 |
| 2.024999999999895 | 2.258 | 2.846 | 3.619 |
| 2.029999999999895 | 2.263 | 2.85 | 3.622 |
| 2.034999999999894 | 2.267 | 2.853 | 3.625 |
| 2.039999999999894 | 2.272 | 2.857 | 3.628 |
| 2.044999999999894 | 2.276 | 2.86 | 3.631 |
| 2.049999999999894 | 2.281 | 2.864 | 3.634 |
| 2.054999999999894 | 2.285 | 2.868 | 3.636 |
| 2.059999999999894 | 2.29 | 2.871 | 3.639 |
| 2.064999999999894 | 2.294 | 2.875 | 3.642 |
| 2.069999999999894 | 2.299 | 2.878 | 3.645 |
| 2.074999999999894 | 2.303 | 2.882 | 3.648 |
| 2.079999999999893 | 2.308 | 2.886 | 3.651 |
| 2.084999999999893 | 2.312 | 2.889 | 3.653 |
| 2.089999999999893 | 2.317 | 2.893 | 3.656 |
| 2.094999999999893 | 2.321 | 2.896 | 3.659 |
| 2.099999999999893 | 2.326 | 2.9 | 3.662 |
| 2.104999999999893 | 2.33 | 2.904 | 3.665 |
| 2.109999999999893 | 2.335 | 2.907 | 3.668 |
| 2.114999999999893 | 2.339 | 2.911 | 3.671 |
| 2.119999999999893 | 2.344 | 2.915 | 3.673 |
| 2.124999999999893 | 2.349 | 2.918 | 3.676 |
| 2.129999999999892 | 2.353 | 2.922 | 3.679 |
| 2.134999999999892 | 2.358 | 2.925 | 3.682 |
| 2.139999999999892 | 2.362 | 2.929 | 3.685 |
| 2.144999999999892 | 2.367 | 2.933 | 3.688 |
| 2.149999999999892 | 2.371 | 2.936 | 3.691 |
| 2.154999999999892 | 2.376 | 2.94 | 3.694 |
| 2.159999999999892 | 2.38 | 2.944 | 3.697 |
| 2.164999999999892 | 2.385 | 2.947 | 3.7 |
| 2.169999999999892 | 2.389 | 2.951 | 3.703 |
| 2.174999999999891 | 2.394 | 2.955 | 3.705 |
| 2.179999999999891 | 2.398 | 2.958 | 3.708 |
| 2.184999999999891 | 2.403 | 2.962 | 3.711 |
| 2.189999999999891 | 2.408 | 2.966 | 3.714 |
| 2.194999999999891 | 2.412 | 2.97 | 3.717 |
| 2.199999999999891 | 2.417 | 2.973 | 3.72 |
| 2.204999999999891 | 2.421 | 2.977 | 3.723 |
| 2.209999999999891 | 2.426 | 2.981 | 3.726 |
| 2.214999999999891 | 2.43 | 2.984 | 3.729 |
| 2.21999999999989 | 2.435 | 2.988 | 3.732 |
| 2.22499999999989 | 2.439 | 2.992 | 3.735 |
| 2.22999999999989 | 2.444 | 2.995 | 3.738 |
| 2.23499999999989 | 2.449 | 2.999 | 3.741 |
| 2.23999999999989 | 2.453 | 3.003 | 3.744 |
| 2.24499999999989 | 2.458 | 3.007 | 3.747 |
| 2.24999999999989 | 2.462 | 3.01 | 3.75 |
| 2.25499999999989 | 2.467 | 3.014 | 3.753 |
| 2.25999999999989 | 2.471 | 3.018 | 3.756 |
| 2.26499999999989 | 2.476 | 3.022 | 3.759 |
| 2.269999999999889 | 2.481 | 3.025 | 3.762 |
| 2.274999999999889 | 2.485 | 3.029 | 3.765 |
| 2.279999999999889 | 2.49 | 3.033 | 3.768 |
| 2.284999999999889 | 2.494 | 3.037 | 3.771 |
| 2.289999999999889 | 2.499 | 3.04 | 3.774 |
| 2.294999999999889 | 2.503 | 3.044 | 3.777 |
| 2.299999999999889 | 2.508 | 3.048 | 3.78 |
| 2.304999999999889 | 2.513 | 3.052 | 3.783 |
| 2.309999999999889 | 2.517 | 3.056 | 3.786 |
| 2.314999999999888 | 2.522 | 3.059 | 3.789 |
| 2.319999999999888 | 2.526 | 3.063 | 3.792 |
| 2.324999999999888 | 2.531 | 3.067 | 3.795 |
| 2.329999999999888 | 2.536 | 3.071 | 3.799 |
| 2.334999999999888 | 2.54 | 3.074 | 3.802 |
| 2.339999999999888 | 2.545 | 3.078 | 3.805 |
| 2.344999999999888 | 2.549 | 3.082 | 3.808 |
| 2.349999999999888 | 2.554 | 3.086 | 3.811 |
| 2.354999999999888 | 2.559 | 3.09 | 3.814 |
| 2.359999999999887 | 2.563 | 3.093 | 3.817 |
| 2.364999999999887 | 2.568 | 3.097 | 3.82 |
| 2.369999999999887 | 2.572 | 3.101 | 3.823 |
| 2.374999999999887 | 2.577 | 3.105 | 3.826 |
| 2.379999999999887 | 2.582 | 3.109 | 3.829 |
| 2.384999999999887 | 2.586 | 3.113 | 3.833 |
| 2.389999999999887 | 2.591 | 3.116 | 3.836 |
| 2.394999999999887 | 2.595 | 3.12 | 3.839 |
| 2.399999999999887 | 2.6 | 3.124 | 3.842 |
| 2.404999999999887 | 2.605 | 3.128 | 3.845 |
| 2.409999999999886 | 2.609 | 3.132 | 3.848 |
| 2.414999999999886 | 2.614 | 3.136 | 3.851 |
| 2.419999999999886 | 2.618 | 3.139 | 3.854 |
| 2.424999999999886 | 2.623 | 3.143 | 3.858 |
| 2.429999999999886 | 2.628 | 3.147 | 3.861 |
| 2.434999999999886 | 2.632 | 3.151 | 3.864 |
| 2.439999999999886 | 2.637 | 3.155 | 3.867 |
| 2.444999999999886 | 2.642 | 3.159 | 3.87 |
| 2.449999999999886 | 2.646 | 3.163 | 3.873 |
| 2.454999999999885 | 2.651 | 3.167 | 3.876 |
| 2.459999999999885 | 2.655 | 3.17 | 3.88 |
| 2.464999999999885 | 2.66 | 3.174 | 3.883 |
| 2.469999999999885 | 2.665 | 3.178 | 3.886 |
| 2.474999999999885 | 2.669 | 3.182 | 3.889 |
| 2.479999999999885 | 2.674 | 3.186 | 3.892 |
| 2.484999999999885 | 2.679 | 3.19 | 3.896 |
| 2.489999999999885 | 2.683 | 3.194 | 3.899 |
| 2.494999999999885 | 2.688 | 3.198 | 3.902 |
| 2.499999999999884 | 2.693 | 3.202 | 3.905 |
| 2.504999999999884 | 2.697 | 3.205 | 3.908 |
| 2.509999999999884 | 2.702 | 3.209 | 3.912 |
| 2.514999999999884 | 2.707 | 3.213 | 3.915 |
| 2.519999999999884 | 2.711 | 3.217 | 3.918 |
| 2.524999999999884 | 2.716 | 3.221 | 3.921 |
| 2.529999999999884 | 2.72 | 3.225 | 3.924 |
| 2.534999999999884 | 2.725 | 3.229 | 3.928 |
| 2.539999999999884 | 2.73 | 3.233 | 3.931 |
| 2.544999999999884 | 2.734 | 3.237 | 3.934 |
| 2.549999999999883 | 2.739 | 3.241 | 3.937 |
| 2.554999999999883 | 2.744 | 3.245 | 3.941 |
| 2.559999999999883 | 2.748 | 3.249 | 3.944 |
| 2.564999999999883 | 2.753 | 3.253 | 3.947 |
| 2.569999999999883 | 2.758 | 3.257 | 3.95 |
| 2.574999999999883 | 2.762 | 3.26 | 3.954 |
| 2.579999999999883 | 2.767 | 3.264 | 3.957 |
| 2.584999999999883 | 2.772 | 3.268 | 3.96 |
| 2.589999999999883 | 2.776 | 3.272 | 3.963 |
| 2.594999999999882 | 2.781 | 3.276 | 3.967 |
| 2.599999999999882 | 2.786 | 3.28 | 3.97 |
| 2.604999999999882 | 2.79 | 3.284 | 3.973 |
| 2.609999999999882 | 2.795 | 3.288 | 3.976 |
| 2.614999999999882 | 2.8 | 3.292 | 3.98 |
| 2.619999999999882 | 2.804 | 3.296 | 3.983 |
| 2.624999999999882 | 2.809 | 3.3 | 3.986 |
| 2.629999999999882 | 2.814 | 3.304 | 3.99 |
| 2.634999999999882 | 2.818 | 3.308 | 3.993 |
| 2.639999999999881 | 2.823 | 3.312 | 3.996 |
| 2.644999999999881 | 2.828 | 3.316 | 4 |
| 2.649999999999881 | 2.832 | 3.32 | 4.003 |
| 2.654999999999881 | 2.837 | 3.324 | 4.006 |
| 2.659999999999881 | 2.842 | 3.328 | 4.009 |
| 2.664999999999881 | 2.846 | 3.332 | 4.013 |
| 2.669999999999881 | 2.851 | 3.336 | 4.016 |
| 2.674999999999881 | 2.856 | 3.34 | 4.019 |
| 2.679999999999881 | 2.86 | 3.344 | 4.023 |
| 2.68499999999988 | 2.865 | 3.348 | 4.026 |
| 2.68999999999988 | 2.87 | 3.352 | 4.029 |
| 2.69499999999988 | 2.875 | 3.356 | 4.033 |
| 2.69999999999988 | 2.879 | 3.36 | 4.036 |
| 2.70499999999988 | 2.884 | 3.364 | 4.039 |
| 2.70999999999988 | 2.889 | 3.368 | 4.043 |
| 2.71499999999988 | 2.893 | 3.372 | 4.046 |
| 2.71999999999988 | 2.898 | 3.376 | 4.049 |
| 2.72499999999988 | 2.903 | 3.38 | 4.053 |
| 2.72999999999988 | 2.907 | 3.384 | 4.056 |
| 2.734999999999879 | 2.912 | 3.388 | 4.06 |
| 2.739999999999879 | 2.917 | 3.392 | 4.063 |
| 2.744999999999879 | 2.921 | 3.396 | 4.066 |
| 2.749999999999879 | 2.926 | 3.4 | 4.07 |
| 2.754999999999879 | 2.931 | 3.404 | 4.073 |
| 2.759999999999879 | 2.936 | 3.408 | 4.076 |
| 2.764999999999879 | 2.94 | 3.413 | 4.08 |
| 2.769999999999879 | 2.945 | 3.417 | 4.083 |
| 2.774999999999879 | 2.95 | 3.421 | 4.087 |
| 2.779999999999878 | 2.954 | 3.425 | 4.09 |
| 2.784999999999878 | 2.959 | 3.429 | 4.093 |
| 2.789999999999878 | 2.964 | 3.433 | 4.097 |
| 2.794999999999878 | 2.969 | 3.437 | 4.1 |
| 2.799999999999878 | 2.973 | 3.441 | 4.104 |
| 2.804999999999878 | 2.978 | 3.445 | 4.107 |
| 2.809999999999878 | 2.983 | 3.449 | 4.11 |
| 2.814999999999878 | 2.987 | 3.453 | 4.114 |
| 2.819999999999878 | 2.992 | 3.457 | 4.117 |
| 2.824999999999878 | 2.997 | 3.461 | 4.121 |
| 2.829999999999877 | 3.001 | 3.465 | 4.124 |
| 2.834999999999877 | 3.006 | 3.469 | 4.128 |
| 2.839999999999877 | 3.011 | 3.474 | 4.131 |
| 2.844999999999877 | 3.016 | 3.478 | 4.134 |
| 2.849999999999877 | 3.02 | 3.482 | 4.138 |
| 2.854999999999877 | 3.025 | 3.486 | 4.141 |
| 2.859999999999877 | 3.03 | 3.49 | 4.145 |
| 2.864999999999877 | 3.035 | 3.494 | 4.148 |
| 2.869999999999877 | 3.039 | 3.498 | 4.152 |
| 2.874999999999876 | 3.044 | 3.502 | 4.155 |
| 2.879999999999876 | 3.049 | 3.506 | 4.159 |
| 2.884999999999876 | 3.053 | 3.51 | 4.162 |
| 2.889999999999876 | 3.058 | 3.515 | 4.166 |
| 2.894999999999876 | 3.063 | 3.519 | 4.169 |
| 2.899999999999876 | 3.068 | 3.523 | 4.173 |
| 2.904999999999876 | 3.072 | 3.527 | 4.176 |
| 2.909999999999876 | 3.077 | 3.531 | 4.179 |
| 2.914999999999876 | 3.082 | 3.535 | 4.183 |
| 2.919999999999876 | 3.086 | 3.539 | 4.186 |
| 2.924999999999875 | 3.091 | 3.543 | 4.19 |
| 2.929999999999875 | 3.096 | 3.548 | 4.193 |
| 2.934999999999875 | 3.101 | 3.552 | 4.197 |
| 2.939999999999875 | 3.105 | 3.556 | 4.2 |
| 2.944999999999875 | 3.11 | 3.56 | 4.204 |
| 2.949999999999875 | 3.115 | 3.564 | 4.207 |
| 2.954999999999875 | 3.12 | 3.568 | 4.211 |
| 2.959999999999875 | 3.124 | 3.572 | 4.214 |
| 2.964999999999875 | 3.129 | 3.576 | 4.218 |
| 2.969999999999874 | 3.134 | 3.581 | 4.221 |
| 2.974999999999874 | 3.139 | 3.585 | 4.225 |
| 2.979999999999874 | 3.143 | 3.589 | 4.229 |
| 2.984999999999874 | 3.148 | 3.593 | 4.232 |
| 2.989999999999874 | 3.153 | 3.597 | 4.236 |
| 2.994999999999874 | 3.158 | 3.601 | 4.239 |
| 2.999999999999874 | 3.162 | 3.606 | 4.243 |
| 3.004999999999874 | 3.167 | 3.61 | 4.246 |
| 3.009999999999874 | 3.172 | 3.614 | 4.25 |
| 3.014999999999874 | 3.177 | 3.618 | 4.253 |
| 3.019999999999873 | 3.181 | 3.622 | 4.257 |
| 3.024999999999873 | 3.186 | 3.626 | 4.26 |
| 3.029999999999873 | 3.191 | 3.631 | 4.264 |
| 3.034999999999873 | 3.196 | 3.635 | 4.267 |
| 3.039999999999873 | 3.2 | 3.639 | 4.271 |
| 3.044999999999873 | 3.205 | 3.643 | 4.275 |
| 3.049999999999873 | 3.21 | 3.647 | 4.278 |
| 3.054999999999873 | 3.215 | 3.651 | 4.282 |
| 3.059999999999873 | 3.219 | 3.656 | 4.285 |
| 3.064999999999872 | 3.224 | 3.66 | 4.289 |
| 3.069999999999872 | 3.229 | 3.664 | 4.292 |
| 3.074999999999872 | 3.234 | 3.668 | 4.296 |
| 3.079999999999872 | 3.238 | 3.672 | 4.3 |
| 3.084999999999872 | 3.243 | 3.677 | 4.303 |
| 3.089999999999872 | 3.248 | 3.681 | 4.307 |
| 3.094999999999872 | 3.253 | 3.685 | 4.31 |
| 3.099999999999872 | 3.257 | 3.689 | 4.314 |
| 3.104999999999872 | 3.262 | 3.693 | 4.318 |
| 3.109999999999872 | 3.267 | 3.698 | 4.321 |
| 3.114999999999871 | 3.272 | 3.702 | 4.325 |
| 3.119999999999871 | 3.276 | 3.706 | 4.328 |
| 3.124999999999871 | 3.281 | 3.71 | 4.332 |
| 3.129999999999871 | 3.286 | 3.714 | 4.336 |
| 3.134999999999871 | 3.291 | 3.719 | 4.339 |
| 3.139999999999871 | 3.295 | 3.723 | 4.343 |
| 3.144999999999871 | 3.3 | 3.727 | 4.346 |
| 3.149999999999871 | 3.305 | 3.731 | 4.35 |
| 3.154999999999871 | 3.31 | 3.736 | 4.354 |
| 3.15999999999987 | 3.314 | 3.74 | 4.357 |
| 3.16499999999987 | 3.319 | 3.744 | 4.361 |
| 3.16999999999987 | 3.324 | 3.748 | 4.365 |
| 3.17499999999987 | 3.329 | 3.752 | 4.368 |
| 3.17999999999987 | 3.334 | 3.757 | 4.372 |
| 3.18499999999987 | 3.338 | 3.761 | 4.375 |
| 3.18999999999987 | 3.343 | 3.765 | 4.379 |
| 3.19499999999987 | 3.348 | 3.769 | 4.383 |
| 3.19999999999987 | 3.353 | 3.774 | 4.386 |
| 3.204999999999869 | 3.357 | 3.778 | 4.39 |
| 3.209999999999869 | 3.362 | 3.782 | 4.394 |
| 3.214999999999869 | 3.367 | 3.786 | 4.397 |
| 3.219999999999869 | 3.372 | 3.791 | 4.401 |
| 3.224999999999869 | 3.376 | 3.795 | 4.405 |
| 3.229999999999869 | 3.381 | 3.799 | 4.408 |
| 3.234999999999869 | 3.386 | 3.803 | 4.412 |
| 3.239999999999869 | 3.391 | 3.808 | 4.416 |
| 3.244999999999869 | 3.396 | 3.812 | 4.419 |
| 3.249999999999869 | 3.4 | 3.816 | 4.423 |
| 3.254999999999868 | 3.405 | 3.82 | 4.427 |
| 3.259999999999868 | 3.41 | 3.825 | 4.43 |
| 3.264999999999868 | 3.415 | 3.829 | 4.434 |
| 3.269999999999868 | 3.419 | 3.833 | 4.438 |
| 3.274999999999868 | 3.424 | 3.837 | 4.441 |
| 3.279999999999868 | 3.429 | 3.842 | 4.445 |
| 3.284999999999868 | 3.434 | 3.846 | 4.449 |
| 3.289999999999868 | 3.439 | 3.85 | 4.452 |
| 3.294999999999868 | 3.443 | 3.854 | 4.456 |
| 3.299999999999867 | 3.448 | 3.859 | 4.46 |
| 3.304999999999867 | 3.453 | 3.863 | 4.464 |
| 3.309999999999867 | 3.458 | 3.867 | 4.467 |
| 3.314999999999867 | 3.463 | 3.872 | 4.471 |
| 3.319999999999867 | 3.467 | 3.876 | 4.475 |
| 3.324999999999867 | 3.472 | 3.88 | 4.478 |
| 3.329999999999867 | 3.477 | 3.884 | 4.482 |
| 3.334999999999867 | 3.482 | 3.889 | 4.486 |
| 3.339999999999867 | 3.486 | 3.893 | 4.489 |
| 3.344999999999866 | 3.491 | 3.897 | 4.493 |
| 3.349999999999866 | 3.496 | 3.902 | 4.497 |
| 3.354999999999866 | 3.501 | 3.906 | 4.501 |
| 3.359999999999866 | 3.506 | 3.91 | 4.504 |
| 3.364999999999866 | 3.51 | 3.914 | 4.508 |
| 3.369999999999866 | 3.515 | 3.919 | 4.512 |
| 3.374999999999866 | 3.52 | 3.923 | 4.516 |
| 3.379999999999866 | 3.525 | 3.927 | 4.519 |
| 3.384999999999866 | 3.53 | 3.932 | 4.523 |
| 3.389999999999866 | 3.534 | 3.936 | 4.527 |
| 3.394999999999865 | 3.539 | 3.94 | 4.531 |
| 3.399999999999865 | 3.544 | 3.945 | 4.534 |
| 3.404999999999865 | 3.549 | 3.949 | 4.538 |
| 3.409999999999865 | 3.554 | 3.953 | 4.542 |
| 3.414999999999865 | 3.558 | 3.958 | 4.546 |
| 3.419999999999865 | 3.563 | 3.962 | 4.549 |
| 3.424999999999865 | 3.568 | 3.966 | 4.553 |
| 3.429999999999865 | 3.573 | 3.971 | 4.557 |
| 3.434999999999865 | 3.578 | 3.975 | 4.561 |
| 3.439999999999864 | 3.582 | 3.979 | 4.564 |
| 3.444999999999864 | 3.587 | 3.983 | 4.568 |
| 3.449999999999864 | 3.592 | 3.988 | 4.572 |
| 3.454999999999864 | 3.597 | 3.992 | 4.576 |
| 3.459999999999864 | 3.602 | 3.996 | 4.579 |
| 3.464999999999864 | 3.606 | 4.001 | 4.583 |
| 3.469999999999864 | 3.611 | 4.005 | 4.587 |
| 3.474999999999864 | 3.616 | 4.009 | 4.591 |
| 3.479999999999864 | 3.621 | 4.014 | 4.595 |
| 3.484999999999864 | 3.626 | 4.018 | 4.598 |
| 3.489999999999863 | 3.63 | 4.022 | 4.602 |
| 3.494999999999863 | 3.635 | 4.027 | 4.606 |
| 3.499999999999863 | 3.64 | 4.031 | 4.61 |
| 3.504999999999863 | 3.645 | 4.035 | 4.614 |
| 3.509999999999863 | 3.65 | 4.04 | 4.617 |
| 3.514999999999863 | 3.654 | 4.044 | 4.621 |
| 3.519999999999863 | 3.659 | 4.049 | 4.625 |
| 3.524999999999863 | 3.664 | 4.053 | 4.629 |
| 3.529999999999863 | 3.669 | 4.057 | 4.633 |
| 3.534999999999862 | 3.674 | 4.062 | 4.636 |
| 3.539999999999862 | 3.679 | 4.066 | 4.64 |
| 3.544999999999862 | 3.683 | 4.07 | 4.644 |
| 3.549999999999862 | 3.688 | 4.075 | 4.648 |
| 3.554999999999862 | 3.693 | 4.079 | 4.652 |
| 3.559999999999862 | 3.698 | 4.083 | 4.655 |
| 3.564999999999862 | 3.703 | 4.088 | 4.659 |
| 3.569999999999862 | 3.707 | 4.092 | 4.663 |
| 3.574999999999862 | 3.712 | 4.096 | 4.667 |
| 3.579999999999862 | 3.717 | 4.101 | 4.671 |
| 3.584999999999861 | 3.722 | 4.105 | 4.675 |
| 3.589999999999861 | 3.727 | 4.11 | 4.678 |
| 3.594999999999861 | 3.731 | 4.114 | 4.682 |
| 3.599999999999861 | 3.736 | 4.118 | 4.686 |
| 3.604999999999861 | 3.741 | 4.123 | 4.69 |
| 3.609999999999861 | 3.746 | 4.127 | 4.694 |
| 3.614999999999861 | 3.751 | 4.131 | 4.698 |
| 3.619999999999861 | 3.756 | 4.136 | 4.702 |
| 3.62499999999986 | 3.76 | 4.14 | 4.705 |
| 3.62999999999986 | 3.765 | 4.145 | 4.709 |
| 3.63499999999986 | 3.77 | 4.149 | 4.713 |
| 3.63999999999986 | 3.775 | 4.153 | 4.717 |
| 3.64499999999986 | 3.78 | 4.158 | 4.721 |
| 3.64999999999986 | 3.785 | 4.162 | 4.725 |
| 3.65499999999986 | 3.789 | 4.166 | 4.729 |
| 3.65999999999986 | 3.794 | 4.171 | 4.732 |
| 3.66499999999986 | 3.799 | 4.175 | 4.736 |
| 3.669999999999859 | 3.804 | 4.18 | 4.74 |
| 3.674999999999859 | 3.809 | 4.184 | 4.744 |
| 3.679999999999859 | 3.813 | 4.188 | 4.748 |
| 3.684999999999859 | 3.818 | 4.193 | 4.752 |
| 3.689999999999859 | 3.823 | 4.197 | 4.756 |
| 3.694999999999859 | 3.828 | 4.202 | 4.76 |
| 3.699999999999859 | 3.833 | 4.206 | 4.763 |
| 3.704999999999859 | 3.838 | 4.21 | 4.767 |
| 3.709999999999859 | 3.842 | 4.215 | 4.771 |
| 3.714999999999859 | 3.847 | 4.219 | 4.775 |
| 3.719999999999858 | 3.852 | 4.224 | 4.779 |
| 3.724999999999858 | 3.857 | 4.228 | 4.783 |
| 3.729999999999858 | 3.862 | 4.232 | 4.787 |
| 3.734999999999858 | 3.867 | 4.237 | 4.791 |
| 3.739999999999858 | 3.871 | 4.241 | 4.795 |
| 3.744999999999858 | 3.876 | 4.246 | 4.798 |
| 3.749999999999858 | 3.881 | 4.25 | 4.802 |
| 3.754999999999858 | 3.886 | 4.254 | 4.806 |
| 3.759999999999858 | 3.891 | 4.259 | 4.81 |
| 3.764999999999857 | 3.896 | 4.263 | 4.814 |
| 3.769999999999857 | 3.9 | 4.268 | 4.818 |
| 3.774999999999857 | 3.905 | 4.272 | 4.822 |
| 3.779999999999857 | 3.91 | 4.276 | 4.826 |
| 3.784999999999857 | 3.915 | 4.281 | 4.83 |
| 3.789999999999857 | 3.92 | 4.285 | 4.834 |
| 3.794999999999857 | 3.925 | 4.29 | 4.838 |
| 3.799999999999857 | 3.929 | 4.294 | 4.841 |
| 3.804999999999857 | 3.934 | 4.299 | 4.845 |
| 3.809999999999857 | 3.939 | 4.303 | 4.849 |
| 3.814999999999856 | 3.944 | 4.307 | 4.853 |
| 3.819999999999856 | 3.949 | 4.312 | 4.857 |
| 3.824999999999856 | 3.954 | 4.316 | 4.861 |
| 3.829999999999856 | 3.958 | 4.321 | 4.865 |
| 3.834999999999856 | 3.963 | 4.325 | 4.869 |
| 3.839999999999856 | 3.968 | 4.33 | 4.873 |
| 3.844999999999856 | 3.973 | 4.334 | 4.877 |
| 3.849999999999856 | 3.978 | 4.338 | 4.881 |
| 3.854999999999856 | 3.983 | 4.343 | 4.885 |
| 3.859999999999855 | 3.987 | 4.347 | 4.889 |
| 3.864999999999855 | 3.992 | 4.352 | 4.893 |
| 3.869999999999855 | 3.997 | 4.356 | 4.897 |
| 3.874999999999855 | 4.002 | 4.361 | 4.901 |
| 3.879999999999855 | 4.007 | 4.365 | 4.905 |
| 3.884999999999855 | 4.012 | 4.37 | 4.908 |
| 3.889999999999855 | 4.016 | 4.374 | 4.912 |
| 3.894999999999855 | 4.021 | 4.378 | 4.916 |
| 3.899999999999855 | 4.026 | 4.383 | 4.92 |
| 3.904999999999855 | 4.031 | 4.387 | 4.924 |
| 3.909999999999854 | 4.036 | 4.392 | 4.928 |
| 3.914999999999854 | 4.041 | 4.396 | 4.932 |
| 3.919999999999854 | 4.046 | 4.401 | 4.936 |
| 3.924999999999854 | 4.05 | 4.405 | 4.94 |
| 3.929999999999854 | 4.055 | 4.41 | 4.944 |
| 3.934999999999854 | 4.06 | 4.414 | 4.948 |
| 3.939999999999854 | 4.065 | 4.419 | 4.952 |
| 3.944999999999854 | 4.07 | 4.423 | 4.956 |
| 3.949999999999854 | 4.075 | 4.427 | 4.96 |
| 3.954999999999853 | 4.079 | 4.432 | 4.964 |
| 3.959999999999853 | 4.084 | 4.436 | 4.968 |
| 3.964999999999853 | 4.089 | 4.441 | 4.972 |
| 3.969999999999853 | 4.094 | 4.445 | 4.976 |
| 3.974999999999853 | 4.099 | 4.45 | 4.98 |
| 3.979999999999853 | 4.104 | 4.454 | 4.984 |
| 3.984999999999853 | 4.109 | 4.459 | 4.988 |
| 3.989999999999853 | 4.113 | 4.463 | 4.992 |
| 3.994999999999853 | 4.118 | 4.468 | 4.996 |
| 3.999999999999853 | 4.123 | 4.472 | 5 |
| 4.004999999999852 | 4.128 | 4.477 | 5.004 |
| 4.009999999999852 | 4.133 | 4.481 | 5.008 |
| 4.014999999999852 | 4.138 | 4.486 | 5.012 |
| 4.019999999999852 | 4.143 | 4.49 | 5.016 |
| 4.024999999999852 | 4.147 | 4.495 | 5.02 |
| 4.029999999999852 | 4.152 | 4.499 | 5.024 |
| 4.034999999999852 | 4.157 | 4.503 | 5.028 |
| 4.039999999999851 | 4.162 | 4.508 | 5.032 |
| 4.044999999999852 | 4.167 | 4.512 | 5.036 |
| 4.049999999999851 | 4.172 | 4.517 | 5.04 |
| 4.054999999999851 | 4.176 | 4.521 | 5.044 |
| 4.059999999999851 | 4.181 | 4.526 | 5.048 |
| 4.064999999999851 | 4.186 | 4.53 | 5.052 |
| 4.069999999999851 | 4.191 | 4.535 | 5.056 |
| 4.074999999999851 | 4.196 | 4.539 | 5.06 |
| 4.07999999999985 | 4.201 | 4.544 | 5.064 |
| 4.084999999999851 | 4.206 | 4.548 | 5.068 |
| 4.08999999999985 | 4.21 | 4.553 | 5.072 |
| 4.094999999999851 | 4.215 | 4.557 | 5.076 |
| 4.09999999999985 | 4.22 | 4.562 | 5.08 |
| 4.10499999999985 | 4.225 | 4.566 | 5.084 |
| 4.10999999999985 | 4.23 | 4.571 | 5.088 |
| 4.11499999999985 | 4.235 | 4.575 | 5.092 |
| 4.11999999999985 | 4.24 | 4.58 | 5.097 |
| 4.12499999999985 | 4.244 | 4.584 | 5.101 |
| 4.12999999999985 | 4.249 | 4.589 | 5.105 |
| 4.13499999999985 | 4.254 | 4.593 | 5.109 |
| 4.13999999999985 | 4.259 | 4.598 | 5.113 |
| 4.144999999999849 | 4.264 | 4.602 | 5.117 |
| 4.14999999999985 | 4.269 | 4.607 | 5.121 |
| 4.154999999999849 | 4.274 | 4.611 | 5.125 |
| 4.15999999999985 | 4.279 | 4.616 | 5.129 |
| 4.164999999999849 | 4.283 | 4.62 | 5.133 |
| 4.169999999999849 | 4.288 | 4.625 | 5.137 |
| 4.174999999999849 | 4.293 | 4.629 | 5.141 |
| 4.179999999999848 | 4.298 | 4.634 | 5.145 |
| 4.184999999999849 | 4.303 | 4.638 | 5.149 |
| 4.189999999999848 | 4.308 | 4.643 | 5.153 |
| 4.194999999999848 | 4.313 | 4.647 | 5.157 |
| 4.199999999999848 | 4.317 | 4.652 | 5.161 |
| 4.204999999999848 | 4.322 | 4.656 | 5.165 |
| 4.209999999999848 | 4.327 | 4.661 | 5.17 |
| 4.214999999999848 | 4.332 | 4.665 | 5.174 |
| 4.219999999999847 | 4.337 | 4.67 | 5.178 |
| 4.224999999999848 | 4.342 | 4.674 | 5.182 |
| 4.229999999999847 | 4.347 | 4.679 | 5.186 |
| 4.234999999999847 | 4.351 | 4.684 | 5.19 |
| 4.239999999999847 | 4.356 | 4.688 | 5.194 |
| 4.244999999999847 | 4.361 | 4.693 | 5.198 |
| 4.249999999999847 | 4.366 | 4.697 | 5.202 |
| 4.254999999999847 | 4.371 | 4.702 | 5.206 |
| 4.259999999999846 | 4.376 | 4.706 | 5.21 |
| 4.264999999999847 | 4.381 | 4.711 | 5.214 |
| 4.269999999999846 | 4.386 | 4.715 | 5.219 |
| 4.274999999999846 | 4.39 | 4.72 | 5.223 |
| 4.279999999999846 | 4.395 | 4.724 | 5.227 |
| 4.284999999999846 | 4.4 | 4.729 | 5.231 |
| 4.289999999999846 | 4.405 | 4.733 | 5.235 |
| 4.294999999999846 | 4.41 | 4.738 | 5.239 |
| 4.299999999999846 | 4.415 | 4.742 | 5.243 |
| 4.304999999999846 | 4.42 | 4.747 | 5.247 |
| 4.309999999999845 | 4.424 | 4.751 | 5.251 |
| 4.314999999999846 | 4.429 | 4.756 | 5.255 |
| 4.319999999999845 | 4.434 | 4.761 | 5.26 |
| 4.324999999999846 | 4.439 | 4.765 | 5.264 |
| 4.329999999999845 | 4.444 | 4.77 | 5.268 |
| 4.334999999999845 | 4.449 | 4.774 | 5.272 |
| 4.339999999999845 | 4.454 | 4.779 | 5.276 |
| 4.344999999999845 | 4.459 | 4.783 | 5.28 |
| 4.349999999999845 | 4.463 | 4.788 | 5.284 |
| 4.354999999999845 | 4.468 | 4.792 | 5.288 |
| 4.359999999999844 | 4.473 | 4.797 | 5.292 |
| 4.364999999999845 | 4.478 | 4.801 | 5.297 |
| 4.369999999999844 | 4.483 | 4.806 | 5.301 |
| 4.374999999999844 | 4.488 | 4.81 | 5.305 |
| 4.379999999999844 | 4.493 | 4.815 | 5.309 |
| 4.384999999999844 | 4.498 | 4.82 | 5.313 |
| 4.389999999999844 | 4.502 | 4.824 | 5.317 |
| 4.394999999999844 | 4.507 | 4.829 | 5.321 |
| 4.399999999999844 | 4.512 | 4.833 | 5.325 |
| 4.404999999999844 | 4.517 | 4.838 | 5.33 |
| 4.409999999999843 | 4.522 | 4.842 | 5.334 |
| 4.414999999999844 | 4.527 | 4.847 | 5.338 |
| 4.419999999999843 | 4.532 | 4.851 | 5.342 |
| 4.424999999999843 | 4.537 | 4.856 | 5.346 |
| 4.429999999999843 | 4.541 | 4.861 | 5.35 |
| 4.434999999999843 | 4.546 | 4.865 | 5.354 |
| 4.439999999999843 | 4.551 | 4.87 | 5.359 |
| 4.444999999999843 | 4.556 | 4.874 | 5.363 |
| 4.449999999999842 | 4.561 | 4.879 | 5.367 |
| 4.454999999999843 | 4.566 | 4.883 | 5.371 |
| 4.459999999999842 | 4.571 | 4.888 | 5.375 |
| 4.464999999999843 | 4.576 | 4.892 | 5.379 |
| 4.469999999999842 | 4.58 | 4.897 | 5.383 |
| 4.474999999999842 | 4.585 | 4.902 | 5.388 |
| 4.479999999999842 | 4.59 | 4.906 | 5.392 |
| 4.484999999999842 | 4.595 | 4.911 | 5.396 |
| 4.489999999999842 | 4.6 | 4.915 | 5.4 |
| 4.494999999999842 | 4.605 | 4.92 | 5.404 |
| 4.499999999999841 | 4.61 | 4.924 | 5.408 |
| 4.504999999999842 | 4.615 | 4.929 | 5.412 |
| 4.509999999999841 | 4.62 | 4.934 | 5.417 |
| 4.514999999999842 | 4.624 | 4.938 | 5.421 |
| 4.519999999999841 | 4.629 | 4.943 | 5.425 |
| 4.524999999999841 | 4.634 | 4.947 | 5.429 |
| 4.529999999999841 | 4.639 | 4.952 | 5.433 |
| 4.534999999999841 | 4.644 | 4.956 | 5.437 |
| 4.53999999999984 | 4.649 | 4.961 | 5.442 |
| 4.544999999999841 | 4.654 | 4.966 | 5.446 |
| 4.54999999999984 | 4.659 | 4.97 | 5.45 |
| 4.554999999999841 | 4.663 | 4.975 | 5.454 |
| 4.55999999999984 | 4.668 | 4.979 | 5.458 |
| 4.564999999999841 | 4.673 | 4.984 | 5.463 |
| 4.56999999999984 | 4.678 | 4.988 | 5.467 |
| 4.57499999999984 | 4.683 | 4.993 | 5.471 |
| 4.57999999999984 | 4.688 | 4.998 | 5.475 |
| 4.58499999999984 | 4.693 | 5.002 | 5.479 |
| 4.58999999999984 | 4.698 | 5.007 | 5.483 |
| 4.59499999999984 | 4.703 | 5.011 | 5.488 |
| 4.59999999999984 | 4.707 | 5.016 | 5.492 |
| 4.60499999999984 | 4.712 | 5.021 | 5.496 |
| 4.60999999999984 | 4.717 | 5.025 | 5.5 |
| 4.614999999999839 | 4.722 | 5.03 | 5.504 |
| 4.61999999999984 | 4.727 | 5.034 | 5.509 |
| 4.624999999999839 | 4.732 | 5.039 | 5.513 |
| 4.62999999999984 | 4.737 | 5.044 | 5.517 |
| 4.634999999999839 | 4.742 | 5.048 | 5.521 |
| 4.639999999999838 | 4.747 | 5.053 | 5.525 |
| 4.644999999999839 | 4.751 | 5.057 | 5.53 |
| 4.649999999999838 | 4.756 | 5.062 | 5.534 |
| 4.654999999999839 | 4.761 | 5.066 | 5.538 |
| 4.659999999999838 | 4.766 | 5.071 | 5.542 |
| 4.664999999999838 | 4.771 | 5.076 | 5.546 |
| 4.669999999999838 | 4.776 | 5.08 | 5.551 |
| 4.674999999999838 | 4.781 | 5.085 | 5.555 |
| 4.679999999999837 | 4.786 | 5.089 | 5.559 |
| 4.684999999999838 | 4.791 | 5.094 | 5.563 |
| 4.689999999999837 | 4.795 | 5.099 | 5.567 |
| 4.694999999999838 | 4.8 | 5.103 | 5.572 |
| 4.699999999999837 | 4.805 | 5.108 | 5.576 |
| 4.704999999999837 | 4.81 | 5.112 | 5.58 |
| 4.709999999999837 | 4.815 | 5.117 | 5.584 |
| 4.714999999999837 | 4.82 | 5.122 | 5.588 |
| 4.719999999999837 | 4.825 | 5.126 | 5.593 |
| 4.724999999999837 | 4.83 | 5.131 | 5.597 |
| 4.729999999999836 | 4.835 | 5.135 | 5.601 |
| 4.734999999999836 | 4.839 | 5.14 | 5.605 |
| 4.739999999999836 | 4.844 | 5.145 | 5.61 |
| 4.744999999999836 | 4.849 | 5.149 | 5.614 |
| 4.749999999999836 | 4.854 | 5.154 | 5.618 |
| 4.754999999999836 | 4.859 | 5.158 | 5.622 |
| 4.759999999999836 | 4.864 | 5.163 | 5.627 |
| 4.764999999999836 | 4.869 | 5.168 | 5.631 |
| 4.769999999999836 | 4.874 | 5.172 | 5.635 |
| 4.774999999999835 | 4.879 | 5.177 | 5.639 |
| 4.779999999999835 | 4.883 | 5.182 | 5.643 |
| 4.784999999999835 | 4.888 | 5.186 | 5.648 |
| 4.789999999999835 | 4.893 | 5.191 | 5.652 |
| 4.794999999999835 | 4.898 | 5.195 | 5.656 |
| 4.799999999999835 | 4.903 | 5.2 | 5.66 |
| 4.804999999999835 | 4.908 | 5.205 | 5.665 |
| 4.809999999999835 | 4.913 | 5.209 | 5.669 |
| 4.814999999999835 | 4.918 | 5.214 | 5.673 |
| 4.819999999999835 | 4.923 | 5.218 | 5.677 |
| 4.824999999999835 | 4.928 | 5.223 | 5.682 |
| 4.829999999999834 | 4.932 | 5.228 | 5.686 |
| 4.834999999999834 | 4.937 | 5.232 | 5.69 |
| 4.839999999999834 | 4.942 | 5.237 | 5.694 |
| 4.844999999999834 | 4.947 | 5.242 | 5.699 |
| 4.849999999999834 | 4.952 | 5.246 | 5.703 |
| 4.854999999999834 | 4.957 | 5.251 | 5.707 |
| 4.859999999999834 | 4.962 | 5.255 | 5.711 |
| 4.864999999999834 | 4.967 | 5.26 | 5.716 |
| 4.869999999999834 | 4.972 | 5.265 | 5.72 |
| 4.874999999999834 | 4.977 | 5.269 | 5.724 |
| 4.879999999999833 | 4.981 | 5.274 | 5.728 |
| 4.884999999999834 | 4.986 | 5.279 | 5.733 |
| 4.889999999999833 | 4.991 | 5.283 | 5.737 |
| 4.894999999999833 | 4.996 | 5.288 | 5.741 |
| 4.899999999999833 | 5.001 | 5.292 | 5.745 |
| 4.904999999999833 | 5.006 | 5.297 | 5.75 |
| 4.909999999999833 | 5.011 | 5.302 | 5.754 |
| 4.914999999999833 | 5.016 | 5.306 | 5.758 |
| 4.919999999999832 | 5.021 | 5.311 | 5.762 |
| 4.924999999999833 | 5.025 | 5.316 | 5.767 |
| 4.929999999999832 | 5.03 | 5.32 | 5.771 |
| 4.934999999999832 | 5.035 | 5.325 | 5.775 |
| 4.939999999999832 | 5.04 | 5.33 | 5.78 |
| 4.944999999999832 | 5.045 | 5.334 | 5.784 |
| 4.949999999999832 | 5.05 | 5.339 | 5.788 |
| 4.954999999999832 | 5.055 | 5.343 | 5.792 |
| 4.959999999999832 | 5.06 | 5.348 | 5.797 |
| 4.964999999999832 | 5.065 | 5.353 | 5.801 |
| 4.969999999999831 | 5.07 | 5.357 | 5.805 |
| 4.974999999999831 | 5.075 | 5.362 | 5.81 |
| 4.97999999999983 | 5.079 | 5.367 | 5.814 |
| 4.984999999999831 | 5.084 | 5.371 | 5.818 |
| 4.98999999999983 | 5.089 | 5.376 | 5.822 |
| 4.994999999999831 | 5.094 | 5.381 | 5.827 |
| 4.99999999999983 | 5.099 | 5.385 | 5.831 |